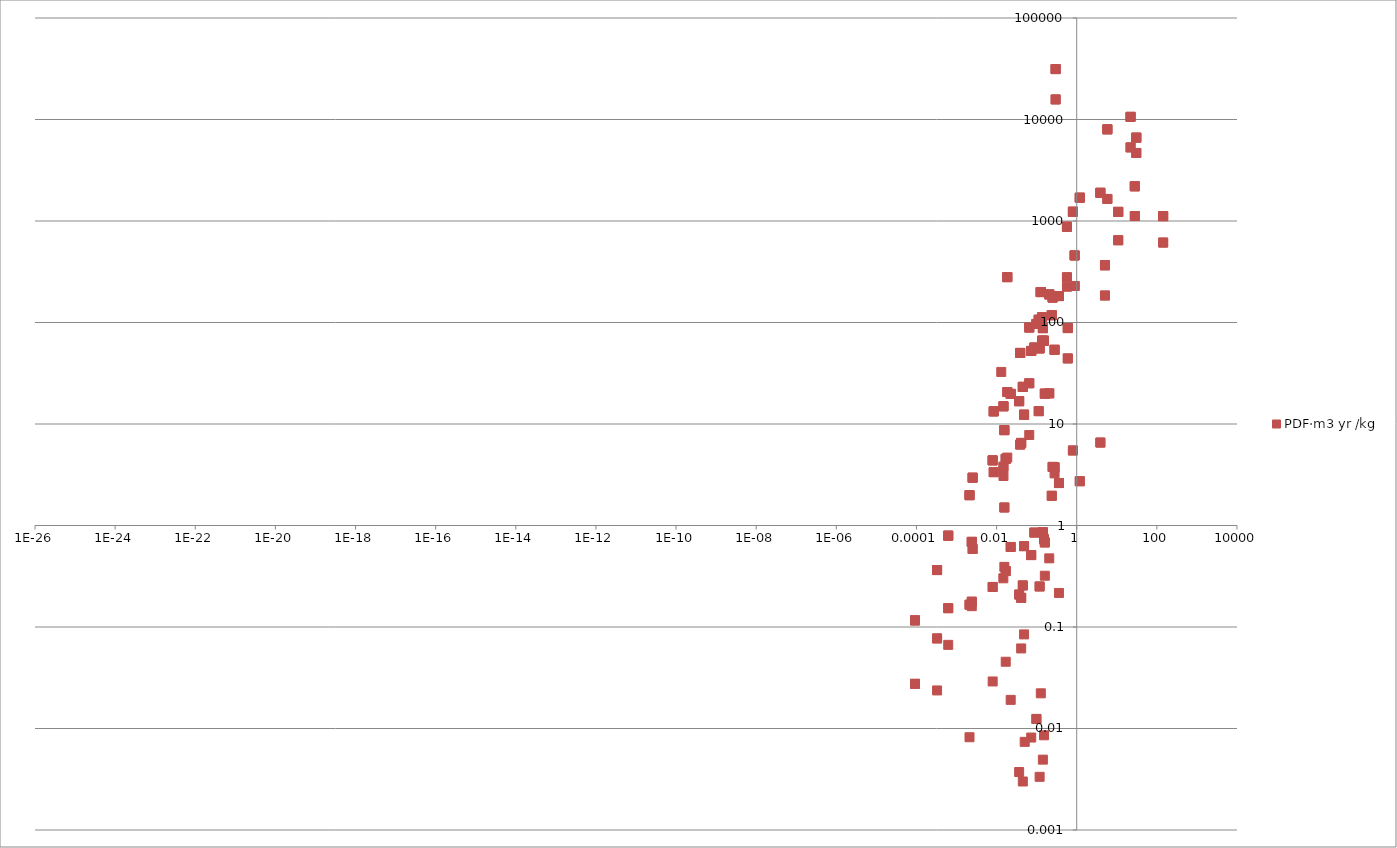
| Category | PDF·m3 yr /kg |
|---|---|
| 0.0 | 0 |
| 0.0 | 0 |
| 0.0 | 0 |
| 0.0 | 0 |
| 0.0 | 0 |
| 0.0 | 0 |
| 0.0 | 0 |
| 0.0 | 0 |
| 0.0 | 0 |
| 0.0 | 0 |
| 0.0 | 0 |
| 0.0 | 0 |
| 0.0 | 0 |
| 0.0 | 0 |
| 0.0 | 0 |
| 0.0 | 0 |
| 0.0 | 0 |
| 0.0 | 0.063 |
| 0.0 | 0.719 |
| 0.0 | 4.67 |
| 0.0 | 0 |
| 0.0 | 4.67 |
| 0.0 | 4.67 |
| 0.0 | 0 |
| 0.0 | 0 |
| 0.0 | 0 |
| 0.0 | 0 |
| 0.0 | 0 |
| 0.0 | 0 |
| 0.009692089763662115 | 0 |
| 0.0 | 0 |
| 0.0 | 0 |
| 0.0 | 0 |
| 0.0 | 0 |
| 0.0 | 0 |
| 0.0 | 0 |
| 0.0 | 0 |
| 0.0 | 0 |
| 0.0 | 0 |
| 0.0 | 0 |
| 0.0 | 0 |
| 0.0 | 0 |
| 0.0 | 0 |
| 0.0 | 0 |
| 0.0 | 0 |
| 0.0 | 0 |
| 0.0 | 0 |
| 0.0 | 0 |
| 0.0 | 0 |
| 0.0 | 0 |
| 0.0 | 0 |
| 0.0 | 0 |
| 0.0 | 0 |
| 0.0 | 0 |
| 0.0 | 0 |
| 0.0 | 0 |
| 0.0 | 0 |
| 0.0 | 0 |
| 0.0 | 0 |
| 0.0 | 0 |
| 0.0 | 0 |
| 0.0 | 0 |
| 0.0 | 0 |
| 0.0 | 0 |
| 0.0 | 0 |
| 0.0 | 0 |
| 0.0 | 0 |
| 0.0 | 0 |
| 0.0 | 0 |
| 0.0 | 0 |
| 0.0 | 0 |
| 0.0 | 0 |
| 0.0 | 0 |
| 0.0 | 0 |
| 0.0004613434727503168 | 0 |
| 0.0004613434727503168 | 0 |
| 0.0004613434727503168 | 0 |
| 0.0004613434727503168 | 0 |
| 0.0004613434727503168 | 0 |
| 6.313704188899892e-08 | 0 |
| 0.0004613434727503168 | 0 |
| 0.0004613434727503168 | 0 |
| 0.0 | 0 |
| 0.0 | 0 |
| 0.0 | 0 |
| 0.0 | 0 |
| 0.0 | 0 |
| 0.0 | 0 |
| 0.0 | 0 |
| 0.0 | 0 |
| 0.0 | 0 |
| 0.0 | 0 |
| 0.0 | 0 |
| 0.0 | 0 |
| 0.0 | 0 |
| 0.0 | 0 |
| 0.0 | 0 |
| 0.0 | 0 |
| 0.0 | 0 |
| 0.0 | 0 |
| 0.0 | 0 |
| 0.0 | 0 |
| 0.0 | 0 |
| 0.0 | 0 |
| 0.0 | 0 |
| 0.0 | 0 |
| 0.0 | 0 |
| 0.0 | 0 |
| 0.0 | 0 |
| 0.0 | 0 |
| 0.0 | 0 |
| 0.0 | 0 |
| 0.0 | 0 |
| 0.0 | 0 |
| 0.0 | 0 |
| 0.0 | 0 |
| 0.0 | 0 |
| 6.53523766921217 | 0 |
| 0.0 | 0 |
| 0.0 | 0 |
| 0.0 | 0 |
| 0.0 | 0 |
| 0.0 | 0 |
| 0.803058866132004 | 0 |
| 0.803058866132004 | 0 |
| 0.803058866132004 | 5.485 |
| 0.803058866132004 | 5.485 |
| 0.803058866132004 | 1234.74 |
| 9.249022803037563e-07 | 0 |
| 0.803058866132004 | 1234.74 |
| 0.803058866132004 | 1234.74 |
| 0.0 | 0 |
| 0.0 | 0 |
| 0.0 | 0 |
| 0.0 | 0 |
| 0.0 | 0 |
| 0.0 | 0 |
| 0.0 | 0 |
| 0.0 | 0 |
| 0.0 | 0 |
| 0.047020481196280786 | 0 |
| 0.00012461258267565576 | 0 |
| 0.00012461258267565576 | 0 |
| 0.00016282710802952355 | 0 |
| 0.00016282710802952355 | 0 |
| 0.00016282710802952355 | 0 |
| 0.0 | 0.089 |
| 0.0 | 0 |
| 0.0 | 0 |
| 0.0 | 0 |
| 0.0 | 0 |
| 0.0 | 0 |
| 0.0 | 0 |
| 0.0 | 0 |
| 0.0 | 0 |
| 0.0 | 0 |
| 0.0031180837353952983 | 0 |
| 0.0031180837353952983 | 0 |
| 0.0008584422362100732 | 0 |
| 0.0008584422362100732 | 0 |
| 0.0008584422362100732 | 0 |
| 0.014842743180922555 | 3.075 |
| 0.014842743180922555 | 0 |
| 0.014842743180922555 | 3.793 |
| 0.014842743180922555 | 3.793 |
| 0.014842743180922555 | 14.952 |
| 1.1187440755769987e-07 | 0 |
| 0.014842743180922555 | 14.952 |
| 0.014842743180922555 | 14.952 |
| 0.0 | 0 |
| 0.0 | 0 |
| 0.0 | 0 |
| 0.0 | 0 |
| 0.0 | 0 |
| 0.0 | 0 |
| 0.0 | 0 |
| 6.036787338509547e-06 | 0 |
| 6.036787338509547e-06 | 0 |
| 5.870637228275339e-06 | 0 |
| 5.870637228275339e-06 | 0 |
| 5.870637228275339e-06 | 0 |
| 0.0003267618834606085 | 0.024 |
| 0.0003267618834606085 | 0 |
| 0.0003267618834606085 | 0.077 |
| 0.0003267618834606085 | 0.077 |
| 0.0003267618834606085 | 0.364 |
| 1.9107262676933888e-07 | 0 |
| 0.0003267618834606085 | 0.364 |
| 0.0003267618834606085 | 0.364 |
| 5.593720377884994e-05 | 0 |
| 5.593720377884994e-05 | 0 |
| 5.4054169196195575e-05 | 0 |
| 5.4054169196195575e-05 | 0 |
| 5.4054169196195575e-05 | 0 |
| 0.00251994333855215 | 0 |
| 0.00251994333855215 | 0 |
| 0.00251994333855215 | 0.587 |
| 0.00251994333855215 | 0.587 |
| 0.00251994333855215 | 2.957 |
| 8.03058866132004e-06 | 0 |
| 0.00251994333855215 | 2.957 |
| 0.00251994333855215 | 2.957 |
| 0.0 | 7.959 |
| 0.0 | 7.959 |
| 0.0 | 40.059 |
| 0.0 | 0 |
| 0.0 | 40.059 |
| 0.0 | 40.059 |
| 0.0 | 0 |
| 0.0 | 0 |
| 0.0 | 0 |
| 0.0 | 0 |
| 0.0 | 0 |
| 0.0 | 0 |
| 0.0 | 0 |
| 0.0 | 0 |
| 0.0 | 0 |
| 0.23482548913101356 | 0 |
| 0.1606117732264008 | 0 |
| 0.1606117732264008 | 0 |
| 0.19273412787168093 | 0 |
| 0.19273412787168093 | 0 |
| 0.19273412787168093 | 0 |
| 0.01307047533842434 | 32.574 |
| 0.01307047533842434 | 0 |
| 0.01307047533842434 | 0 |
| 0.01307047533842434 | 0 |
| 0.01307047533842434 | 0 |
| 1.672577776357691e-11 | 0 |
| 0.01307047533842434 | 0 |
| 0.01307047533842434 | 0 |
| 0.0022984098582398737 | 0 |
| 0.0022984098582398737 | 0 |
| 0.0005649103747963063 | 0 |
| 0.0005649103747963063 | 0 |
| 0.0005649103747963063 | 0 |
| 0.11242824125848054 | 0 |
| 0.11242824125848054 | 0 |
| 0.11242824125848054 | 13.378 |
| 0.11242824125848054 | 13.378 |
| 0.11242824125848054 | 106.473 |
| 9.636706393584046e-05 | 0 |
| 0.11242824125848054 | 106.473 |
| 0.11242824125848054 | 106.473 |
| 0.0 | 0 |
| 0.0 | 0 |
| 0.0 | 0 |
| 0.0 | 0 |
| 0.0 | 0 |
| 0.0 | 0 |
| 0.0 | 0 |
| 0.0 | 0 |
| 0.0 | 0 |
| 0.0 | 0 |
| 0.0 | 0 |
| 0.0 | 0 |
| 0.0 | 0 |
| 0.0 | 0 |
| 0.0 | 0 |
| 0.0 | 0 |
| 0.0 | 0 |
| 0.0 | 0 |
| 0.0 | 0 |
| 0.0 | 0 |
| 0.0038269908723945847 | 0 |
| 0.0038269908723945847 | 0 |
| 0.0012793558488033993 | 0 |
| 0.0012793558488033993 | 0 |
| 0.0012793558488033993 | 0 |
| 0.0 | 0 |
| 12.350491527409439 | 0 |
| 0.0 | 0 |
| 0.0 | 0 |
| 0.0 | 0 |
| 0.0 | 0 |
| 0.0 | 0 |
| 0.0 | 0 |
| 0.0 | 0 |
| 0.0 | 0 |
| 0.0 | 0 |
| 0.0 | 0 |
| 0.0 | 0 |
| 0.0 | 0 |
| 0.0 | 0 |
| 0.0 | 0 |
| 0.0 | 0 |
| 0.0 | 0 |
| 0.0 | 0 |
| 0.0 | 0 |
| 0.0 | 0 |
| 0.0 | 0 |
| 0.0 | 0 |
| 0.0 | 0 |
| 0.0 | 0 |
| 0.0 | 0 |
| 0.0 | 0 |
| 0.0 | 0 |
| 0.0 | 0 |
| 0.0 | 0 |
| 0.0 | 0 |
| 0.0 | 0 |
| 0.0 | 0 |
| 0.0 | 0 |
| 0.0 | 0 |
| 0.0 | 0 |
| 3.118083735395298 | 0 |
| 0.0 | 0 |
| 0.0 | 0 |
| 0.0 | 0 |
| 0.0 | 0 |
| 0.0 | 0 |
| 0.0 | 0 |
| 0.0 | 0 |
| 0.10688990425067363 | 0 |
| 0.10688990425067363 | 0 |
| 0.03129160409410912 | 0 |
| 0.03129160409410912 | 0 |
| 0.03129160409410912 | 0 |
| 0.0 | 0 |
| 0.0 | 0 |
| 0.0 | 0 |
| 0.0 | 0 |
| 0.0 | 0 |
| 0.0 | 0 |
| 0.0 | 0 |
| 0.0 | 0 |
| 0.0 | 0 |
| 0.013181242078580478 | 0 |
| 0.013181242078580478 | 0 |
| 0.0025919417196536404 | 0 |
| 0.0025919417196536404 | 0 |
| 0.0025919417196536404 | 0 |
| 0.20602613669041756 | 0.475 |
| 0.20602613669041756 | 0 |
| 0.20602613669041756 | 20.031 |
| 0.20602613669041756 | 20.031 |
| 0.20602613669041756 | 189.195 |
| 6.5906210392902396e-09 | 0 |
| 0.20602613669041756 | 189.195 |
| 0.20602613669041756 | 189.195 |
| 0.0 | 0 |
| 0.0 | 0 |
| 0.0 | 0 |
| 0.0 | 0 |
| 0.0 | 0 |
| 0.0 | 0 |
| 0.509527004718237 | 0 |
| 0.509527004718237 | 0 |
| 0.2652863426739516 | 0 |
| 0.2652863426739516 | 0 |
| 0.2652863426739516 | 0 |
| 1.0578223684911223 | 0 |
| 0.5372186897572716 | 0 |
| 0.12904325228190133 | 0 |
| 1.0578223684911223 | 0 |
| 5.067578362143335 | 0 |
| 5.067578362143335 | 0 |
| 5.067578362143335 | 184.488 |
| 5.067578362143335 | 184.488 |
| 5.067578362143335 | 366.45 |
| 4.8017381857686026e-23 | 0 |
| 5.067578362143335 | 366.45 |
| 5.067578362143335 | 366.45 |
| 0.0 | 0 |
| 0.0 | 0 |
| 0.0 | 0 |
| 0.0 | 0 |
| 0.0 | 0 |
| 0.0 | 0 |
| 0.0 | 0 |
| 0.0 | 0 |
| 0.0 | 0 |
| 0.0 | 0 |
| 0.0 | 0 |
| 0.0 | 0 |
| 0.0 | 0 |
| 0.0 | 0 |
| 0.0 | 0 |
| 0.0 | 0 |
| 0.0 | 0 |
| 0.0 | 0 |
| 0.0 | 0 |
| 0.0 | 0 |
| 0.0 | 0 |
| 0.0 | 0 |
| 0.0 | 0 |
| 0.0 | 0 |
| 0.0 | 0 |
| 0.0 | 0 |
| 0.0 | 0 |
| 0.0 | 0 |
| 0.0 | 0 |
| 0.0 | 0 |
| 0.0 | 0 |
| 0.0 | 0 |
| 0.0 | 0 |
| 0.0 | 0 |
| 0.0 | 0 |
| 0.0 | 0 |
| 0.0 | 0 |
| 0.0 | 0 |
| 0.0 | 0 |
| 0.0 | 0 |
| 0.0 | 0 |
| 0.0 | 0 |
| 0.0 | 0 |
| 0.0 | 0 |
| 0.0 | 0 |
| 0.0 | 0 |
| 0.0 | 0 |
| 0.06646004409368308 | 0 |
| 0.06646004409368308 | 0 |
| 0.07642905070773555 | 0 |
| 0.07642905070773555 | 0 |
| 0.07642905070773555 | 0 |
| 0.04452822954276767 | 0 |
| 0.02824551873981531 | 0 |
| 0.017722678424982156 | 0 |
| 0.04452822954276767 | 0 |
| 5.161730091276053 | 0 |
| 5.161730091276053 | 0 |
| 5.161730091276053 | 0 |
| 5.161730091276053 | 0 |
| 5.161730091276053 | 0 |
| 1.6504244283264633e-23 | 0 |
| 5.161730091276053 | 0 |
| 5.161730091276053 | 0 |
| 0.0 | 0 |
| 0.0 | 0 |
| 0.0 | 0 |
| 0.0 | 0 |
| 0.0 | 0 |
| 0.0 | 0 |
| 0.00023648699023335565 | 0 |
| 0.0 | 0 |
| 9.082872692803356 | 0 |
| 0.0 | 0 |
| 2.603018393669254 | 0 |
| 0.0 | 0 |
| 0.0 | 0 |
| 0.0 | 0 |
| 0.0 | 0 |
| 0.0 | 0 |
| 0.0 | 0 |
| 0.0 | 0 |
| 0.0 | 0 |
| 0.0 | 0 |
| 0.0 | 0 |
| 0.0 | 0 |
| 0.11796657826628747 | 0 |
| 0.11796657826628747 | 0 |
| 0.05870637228275339 | 0 |
| 0.05870637228275339 | 0 |
| 0.05870637228275339 | 0 |
| 0.25144050015443437 | 0 |
| 0.12738175117955924 | 0 |
| 0.02985163647207932 | 0 |
| 0.25144050015443437 | 0 |
| 0.8861339212491078 | 0 |
| 0.8861339212491078 | 0 |
| 0.8861339212491078 | 228.93 |
| 0.8861339212491078 | 228.93 |
| 0.8861339212491078 | 457.83 |
| 1.0467456944755087e-23 | 0 |
| 0.8861339212491078 | 457.83 |
| 0.8861339212491078 | 457.83 |
| 0.0 | 0 |
| 0.0 | 0 |
| 0.0 | 0 |
| 0.0 | 0 |
| 0.0 | 0 |
| 0.0 | 0 |
| 0.0 | 0 |
| 0.0 | 0 |
| 0.0 | 0 |
| 0.0 | 0 |
| 0.0 | 0 |
| 0.0 | 0 |
| 0.0 | 0 |
| 0.0 | 0 |
| 0.0 | 0 |
| 0.0 | 0 |
| 0.0 | 0 |
| 0.019771863117870717 | 0 |
| 0.0 | 0 |
| 0.0 | 0 |
| 0.0 | 0 |
| 0.012959708598268203 | 0 |
| 0.0 | 0 |
| 0.0 | 0 |
| 0.0 | 0 |
| 0.0 | 0 |
| 0.0 | 0 |
| 0.0 | 0 |
| 0.0 | 0 |
| 0.0 | 0 |
| 0.0 | 0 |
| 0.0 | 0 |
| 0.0 | 0 |
| 0.0 | 0 |
| 0.0 | 0 |
| 0.0004923581599940355 | 0 |
| 0.0004923581599940355 | 0 |
| 0.0005649103747963063 | 0 |
| 0.0005649103747963063 | 0 |
| 0.0005649103747963063 | 0 |
| 1.0467456944755086e-05 | 0 |
| 1.0467456944755086e-05 | 0 |
| 1.0688990425067364e-05 | 0 |
| 1.0688990425067364e-05 | 0 |
| 1.0688990425067364e-05 | 0 |
| 0.02248564825169611 | 0.019 |
| 0.02248564825169611 | 0 |
| 0.02248564825169611 | 0.615 |
| 0.02248564825169611 | 0.615 |
| 0.02248564825169611 | 19.795 |
| 2.0602613669041757e-06 | 0 |
| 0.02248564825169611 | 19.795 |
| 0.02248564825169611 | 19.795 |
| 0.2381484913356977 | 0 |
| 0.2381484913356977 | 0 |
| 0.2381484913356977 | 1.963 |
| 0.2381484913356977 | 1.963 |
| 0.2381484913356977 | 117.978 |
| 8.08597203139811e-05 | 0 |
| 0.2381484913356977 | 117.978 |
| 0.2381484913356977 | 117.978 |
| 0.00036663790991681833 | 0 |
| 0.00036663790991681833 | 0 |
| 0.00036774557731837973 | 0 |
| 0.00036774557731837973 | 0 |
| 0.00036774557731837973 | 0 |
| 7.144454740070931e-06 | 0 |
| 7.144454740070931e-06 | 0 |
| 8.307505511710386e-06 | 0 |
| 8.307505511710386e-06 | 0 |
| 8.307505511710386e-06 | 0 |
| 0.0731060485030514 | 0.008 |
| 0.0731060485030514 | 0 |
| 0.0731060485030514 | 0.511 |
| 0.0731060485030514 | 0.511 |
| 0.0731060485030514 | 52.467 |
| 1.0024389984130532e-06 | 0 |
| 0.0731060485030514 | 52.467 |
| 0.0731060485030514 | 52.467 |
| 0.04419592932229926 | 0 |
| 0.04419592932229926 | 0 |
| 0.04402977921206504 | 0 |
| 0.04402977921206504 | 0 |
| 0.04402977921206504 | 0 |
| 0.021433364220212796 | 0 |
| 0.021433364220212796 | 0 |
| 0.021377980850134728 | 0 |
| 0.021377980850134728 | 0 |
| 0.021377980850134728 | 0 |
| 0.0007365988220383208 | 0 |
| 0.0007365988220383208 | 0 |
| 0.0012904325228190133 | 0 |
| 0.0012904325228190133 | 0 |
| 0.0012904325228190133 | 0 |
| 0.0 | 13.06 |
| 0.0 | 0 |
| 0.0 | 0 |
| 0.0 | 0 |
| 0.0 | 0 |
| 0.0 | 0 |
| 0.0 | 0 |
| 0.0 | 0 |
| 26.750167747707444 | 0 |
| 26.750167747707444 | 0 |
| 12.682791747877856 | 0 |
| 12.682791747877856 | 0 |
| 12.682791747877856 | 0 |
| 58.70637228275339 | 0 |
| 29.408569511454765 | 0 |
| 6.756771149524447 | 0 |
| 58.70637228275339 | 0 |
| 143.44292850219932 | 0 |
| 143.44292850219932 | 0 |
| 143.44292850219932 | 613.32 |
| 143.44292850219932 | 613.32 |
| 143.44292850219932 | 1115.82 |
| 5.6491037479630624e-21 | 0 |
| 143.44292850219932 | 1115.82 |
| 143.44292850219932 | 1115.82 |
| 0.0 | 0 |
| 0.04253442821995718 | 0 |
| 0.0 | 0 |
| 1.0412073574677017 | 0 |
| 0.0 | 0 |
| 0.03694070784207218 | 0 |
| 0.0 | 0 |
| 0.0 | 0 |
| 0.0 | 0 |
| 0.0 | 0 |
| 0.0 | 0 |
| 0.0 | 0 |
| 0.0 | 0 |
| 0.0 | 0 |
| 0.0 | 0 |
| 0.0 | 0 |
| 0.0 | 0 |
| 0.0 | 0 |
| 0.0 | 0 |
| 0.0 | 0 |
| 0.0 | 0 |
| 0.0 | 0 |
| 0.0 | 0 |
| 0.0 | 0 |
| 0.0 | 0 |
| 0.0 | 0 |
| 0.0 | 0 |
| 0.0 | 0 |
| 0.0 | 0 |
| 0.0 | 0 |
| 0.0 | 0 |
| 0.0 | 0 |
| 0.0 | 0 |
| 0.0 | 0 |
| 0.0 | 0 |
| 0.0 | 0 |
| 0.0 | 0 |
| 0.0 | 0 |
| 0.0 | 0 |
| 0.0 | 0 |
| 0.0 | 0 |
| 0.0 | 0 |
| 0.0 | 0 |
| 0.0 | 0 |
| 0.0 | 0 |
| 0.0 | 0 |
| 0.0 | 0 |
| 0.086398057321788 | 0 |
| 0.086398057321788 | 0 |
| 0.086398057321788 | 0 |
| 0.086398057321788 | 0 |
| 0.086398057321788 | 0 |
| 6.701387779446378e-13 | 0 |
| 0.086398057321788 | 0 |
| 0.086398057321788 | 0 |
| 0.0 | 0 |
| 0.0 | 0 |
| 0.0 | 0 |
| 0.0 | 0 |
| 0.0 | 0 |
| 0.0 | 0 |
| 0.0 | 0 |
| 0.0 | 0 |
| 0.034393072818481 | 0 |
| 0.034393072818481 | 0 |
| 0.03422692270824679 | 0 |
| 0.03422692270824679 | 0 |
| 0.03422692270824679 | 0 |
| 1.1962807936862956 | 0 |
| 0.23261015432789078 | 0 |
| 0.1545196025178132 | 0 |
| 1.1962807936862956 | 0 |
| 11.132057385691917 | 0 |
| 11.132057385691917 | 0 |
| 11.132057385691917 | 0 |
| 11.132057385691917 | 0 |
| 11.132057385691917 | 0 |
| 0.005394340245603944 | 0 |
| 11.132057385691917 | 0 |
| 11.132057385691917 | 0 |
| 0.0 | 0 |
| 0.0 | 0 |
| 1.7888828535216363 | 0 |
| 0.0 | 0 |
| 1.5895027212405872 | 0 |
| 0.0 | 0 |
| 0.0014787359810844484 | 0 |
| 0.0 | 0 |
| 0.0 | 0 |
| 0.0 | 0 |
| 0.0 | 0 |
| 0.0 | 0 |
| 0.0 | 0 |
| 0.0 | 0 |
| 0.0 | 0 |
| 0.0 | 0 |
| 0.0 | 0 |
| 0.0 | 0 |
| 0.0 | 0 |
| 0.0 | 0 |
| 0.0 | 0 |
| 0.0 | 0 |
| 0.0025864033826458336 | 0 |
| 0.0025864033826458336 | 0 |
| 0.0025864033826458336 | 0 |
| 0.0025864033826458336 | 0 |
| 0.0025864033826458336 | 0 |
| 2.2596414991852248e-07 | 0 |
| 0.0025864033826458336 | 0 |
| 0.0025864033826458336 | 0 |
| 0.0 | 0 |
| 0.0 | 0 |
| 0.0 | 0 |
| 0.0 | 0 |
| 0.0 | 0 |
| 0.0 | 0 |
| 0.0 | 0 |
| 0.0 | 0 |
| 0.0 | 0 |
| 0.0 | 0 |
| 0.0 | 0 |
| 0.0 | 0 |
| 0.0 | 0 |
| 0.0 | 0 |
| 0.0 | 0 |
| 0.0 | 0 |
| 0.0 | 0 |
| 0.0 | 0 |
| 0.0 | 0 |
| 0.0 | 0 |
| 0.0 | 0 |
| 0.0 | 0 |
| 0.0 | 0 |
| 0.0 | 0 |
| 0.0 | 0 |
| 0.0 | 0 |
| 0.0 | 0 |
| 0.0 | 0 |
| 0.0 | 0 |
| 0.0 | 0 |
| 0.0 | 0 |
| 0.0 | 0 |
| 0.0 | 0 |
| 0.0 | 0 |
| 0.15562726991937456 | 0 |
| 0.15562726991937456 | 0 |
| 0.06646004409368308 | 0 |
| 0.06646004409368308 | 0 |
| 0.06646004409368308 | 0 |
| 0.25587116976067986 | 0 |
| 0.04918043262932549 | 0 |
| 0.035279206739730104 | 0 |
| 0.25587116976067986 | 0 |
| 0.0 | 0 |
| 2.985163647207932 | 0 |
| 2.985163647207932 | 0 |
| 2.985163647207932 | 0 |
| 2.985163647207932 | 0 |
| 2.985163647207932 | 0 |
| 5.8706372282753395e-24 | 0 |
| 2.985163647207932 | 0 |
| 2.985163647207932 | 0 |
| 0.0 | 0 |
| 0.0 | 0 |
| 0.0 | 0 |
| 0.0 | 0 |
| 0.0 | 0 |
| 0.0 | 0 |
| 0.0 | 0 |
| 0.0 | 0 |
| 0.0 | 0 |
| 0.0 | 0 |
| 0.0 | 0 |
| 0.0 | 0 |
| 0.0 | 0 |
| 0.0 | 0 |
| 0.0 | 0 |
| 0.0 | 0 |
| 0.0 | 0 |
| 0.0 | 0 |
| 0.0 | 0 |
| 0.0 | 0 |
| 0.0 | 0 |
| 0.0 | 0 |
| 0.0 | 0 |
| 0.0 | 0 |
| 0.0 | 0 |
| 0.0 | 0 |
| 0.0 | 0 |
| 0.006812154519602517 | 0 |
| 0.0 | 0 |
| 0.14731976440766417 | 0 |
| 0.0 | 0 |
| 1.9328796157246164 | 0 |
| 0.0 | 0 |
| 0.019107262676933887 | 0 |
| 0.0 | 0 |
| 4.945734947971583 | 0 |
| 0.0 | 0 |
| 0.0 | 0 |
| 0.0 | 0 |
| 0.0 | 0 |
| 0.0 | 0 |
| 0.0 | 0 |
| 0.0 | 0 |
| 0.0 | 0 |
| 0.0 | 0 |
| 0.0 | 0 |
| 0.0 | 0 |
| 0.0 | 0 |
| 0.0 | 0 |
| 0.0 | 0 |
| 0.0 | 0 |
| 0.0 | 0 |
| 0.0 | 0 |
| 0.0 | 0 |
| 0.0 | 0 |
| 0.0 | 0 |
| 1.517504340139097e-05 | 0 |
| 1.517504340139097e-05 | 0 |
| 1.5673493732093594e-05 | 0 |
| 1.5673493732093594e-05 | 0 |
| 1.5673493732093594e-05 | 0 |
| 0.0 | 0.692 |
| 0.0 | 1.447 |
| 0.0 | 46.026 |
| 0.0 | 0 |
| 0.0 | 46.026 |
| 0.0 | 46.026 |
| 0.0 | 0 |
| 0.0 | 0 |
| 0.0 | 0 |
| 0.0 | 0 |
| 0.0 | 0 |
| 0.0 | 0 |
| 0.0 | 0 |
| 0.0 | 0 |
| 0.0 | 0 |
| 0.0 | 0 |
| 0.0 | 0 |
| 0.0 | 0 |
| 0.0 | 0 |
| 0.0 | 0 |
| 0.0 | 0 |
| 0.0 | 0 |
| 0.0 | 0 |
| 0.0 | 0 |
| 0.0 | 0 |
| 0.0 | 0 |
| 0.0 | 0 |
| 0.0 | 0 |
| 0.0 | 0 |
| 0.0 | 0 |
| 0.0 | 0 |
| 0.0 | 0 |
| 0.0 | 0 |
| 0.0 | 0 |
| 0.0 | 0 |
| 0.0 | 0 |
| 0.0 | 0 |
| 0.0 | 0 |
| 0.0 | 0 |
| 0.11021290645535778 | 0 |
| 0.011132057385691917 | 0 |
| 0.011132057385691917 | 0 |
| 0.011132057385691917 | 0 |
| 0.011132057385691917 | 0 |
| 0.011132057385691917 | 0 |
| 1.2239724787253301e-11 | 0 |
| 0.011132057385691917 | 0 |
| 0.011132057385691917 | 0 |
| 0.0 | 0 |
| 0.0 | 0 |
| 0.0 | 0 |
| 0.0 | 0 |
| 0.0 | 0 |
| 0.0 | 0 |
| 0.0 | 0 |
| 0.0 | 0 |
| 0.0 | 0 |
| 0.0 | 0 |
| 0.0 | 0 |
| 0.0 | 0 |
| 0.0 | 0 |
| 0.0 | 0 |
| 0.0 | 0 |
| 0.0 | 0 |
| 0.0 | 0 |
| 0.0 | 0 |
| 0.0 | 0 |
| 0.0 | 0 |
| 0.0 | 0 |
| 0.0 | 0 |
| 0.0 | 0 |
| 0.0 | 0 |
| 0.0 | 0 |
| 0.0 | 0 |
| 0.0 | 0 |
| 0.0 | 0 |
| 0.0 | 0 |
| 0.0 | 0 |
| 0.0 | 0 |
| 0.0 | 0 |
| 0.0 | 0 |
| 0.0 | 0 |
| 0.0 | 0 |
| 0.0 | 0 |
| 0.0 | 0 |
| 0.0 | 0 |
| 0.0 | 0 |
| 0.0 | 0 |
| 0.0 | 0 |
| 0.0 | 0 |
| 0.0 | 0 |
| 0.0 | 0 |
| 0.0 | 0 |
| 0.0 | 0 |
| 0.0 | 0 |
| 0.0 | 0 |
| 0.0 | 0 |
| 0.0 | 0 |
| 0.0 | 0 |
| 0.0 | 0 |
| 0.0 | 0 |
| 0.0 | 0 |
| 0.0 | 0 |
| 0.0 | 0 |
| 0.0 | 0 |
| 0.0 | 0 |
| 0.0 | 0 |
| 0.0 | 0 |
| 0.0 | 0 |
| 0.0 | 0 |
| 0.0 | 0 |
| 0.0 | 0 |
| 0.0 | 0 |
| 0.0 | 0 |
| 0.0 | 0 |
| 0.0 | 0 |
| 0.0 | 0 |
| 0.0 | 0 |
| 0.0 | 0 |
| 0.0 | 0 |
| 0.0 | 0 |
| 0.0 | 0 |
| 0.0 | 0 |
| 0.0 | 4263.6 |
| 0.0 | 4673.1 |
| 0.0 | 21585.9 |
| 0.0 | 0 |
| 0.0 | 21585.9 |
| 0.0 | 21585.9 |
| 0.0 | 0 |
| 0.0 | 0 |
| 0.0 | 0 |
| 0.0 | 0 |
| 0.0 | 0 |
| 0.0 | 0 |
| 0.0 | 0 |
| 0.0 | 0 |
| 0.0 | 0 |
| 0.008030588661320039 | 0 |
| 0.0 | 0 |
| 0.0 | 0 |
| 0.0 | 0 |
| 0.0 | 0 |
| 0.0 | 0 |
| 0.0 | 0 |
| 0.0 | 0 |
| 0.0 | 0 |
| 0.0 | 0 |
| 0.0 | 0 |
| 0.0 | 0 |
| 0.0 | 0 |
| 0.0 | 0 |
| 0.122397247872533 | 0 |
| 0.0 | 0 |
| 0.0 | 0 |
| 0.0 | 0 |
| 0.0 | 0 |
| 0.0 | 0 |
| 0.0 | 0 |
| 0.0 | 0 |
| 0.0 | 0 |
| 0.003998679319636599 | 0 |
| 0.003998679319636599 | 0 |
| 0.003998679319636599 | 0 |
| 0.003998679319636599 | 0 |
| 0.003998679319636599 | 0 |
| 6.258320818821823 | 0 |
| 6.258320818821823 | 0 |
| 6.258320818821823 | 0 |
| 6.258320818821823 | 0 |
| 6.258320818821823 | 0 |
| 0.0007753671810929693 | 0 |
| 6.258320818821823 | 0 |
| 6.258320818821823 | 0 |
| 0.0 | 0 |
| 0.0 | 0 |
| 0.0 | 0 |
| 0.007809055181007763 | 0 |
| 0.0 | 0 |
| 0.13458158928970826 | 0 |
| 0.13458158928970826 | 0 |
| 0.035113056629495897 | 0 |
| 0.035113056629495897 | 0 |
| 0.035113056629495897 | 0 |
| 0.5704487118041132 | 224.844 |
| 0.5704487118041132 | 0 |
| 0.5704487118041132 | 278.781 |
| 0.5704487118041132 | 278.781 |
| 0.5704487118041132 | 878.43 |
| 4.120522733808351e-13 | 0 |
| 0.5704487118041132 | 878.43 |
| 0.5704487118041132 | 878.43 |
| 5.759870488119201e-05 | 0 |
| 5.759870488119201e-05 | 0 |
| 5.759870488119201e-05 | 0 |
| 5.759870488119201e-05 | 0 |
| 5.759870488119201e-05 | 0 |
| 0.04846044881831058 | 0.085 |
| 0.04846044881831058 | 0 |
| 0.04846044881831058 | 0.626 |
| 0.04846044881831058 | 0.626 |
| 0.04846044881831058 | 12.354 |
| 3.334078878699768e-05 | 0 |
| 0.04846044881831058 | 12.354 |
| 0.04846044881831058 | 12.354 |
| 0.0 | 0 |
| 0.0 | 0 |
| 0.0 | 0 |
| 0.0 | 0 |
| 0.0 | 0 |
| 0.0 | 0 |
| 0.0 | 0 |
| 0.0 | 0 |
| 0.0 | 0 |
| 0.0 | 0 |
| 0.0 | 0 |
| 0.0 | 0 |
| 0.0 | 0 |
| 0.0 | 0 |
| 0.0 | 0 |
| 0.0 | 0 |
| 0.0 | 0 |
| 0.0 | 25.316 |
| 0.0 | 45.39 |
| 0.0 | 166.14 |
| 0.0 | 0 |
| 0.0 | 166.14 |
| 0.0 | 166.14 |
| 0.0 | 0 |
| 0.07365988220383209 | 0 |
| 0.0 | 0 |
| 0.3771607502316515 | 0 |
| 0.0 | 0 |
| 3.2233121385436294 | 0 |
| 0.0 | 0 |
| 0.5073116699151142 | 0 |
| 0.0 | 0 |
| 0.0 | 0 |
| 0.00336730890074661 | 0 |
| 0.00336730890074661 | 0 |
| 0.004203597788925455 | 0 |
| 0.004203597788925455 | 0 |
| 0.004203597788925455 | 0 |
| 0.0014842743180922557 | 0 |
| 0.0010744373795145432 | 0 |
| 0.0008861339212491077 | 0 |
| 0.0014842743180922557 | 0 |
| 0.00336730890074661 | 0 |
| 0.00336730890074661 | 0 |
| 0.004203597788925455 | 0 |
| 0.004203597788925455 | 0 |
| 0.004203597788925455 | 0 |
| 0.0014842743180922557 | 0 |
| 0.0010744373795145432 | 0 |
| 0.0008861339212491077 | 0 |
| 0.0014842743180922557 | 0 |
| 0.2974086973192318 | 0 |
| 0.2974086973192318 | 0 |
| 0.2974086973192318 | 15766.5 |
| 0.2974086973192318 | 15766.5 |
| 0.2974086973192318 | 31392 |
| 3.1623904314577535e-25 | 0 |
| 0.2974086973192318 | 31392 |
| 0.2974086973192318 | 31392 |
| 0.0 | 0 |
| 0.2974086973192318 | 0 |
| 0.2974086973192318 | 0 |
| 0.2974086973192318 | 0 |
| 0.2974086973192318 | 0 |
| 0.2974086973192318 | 0 |
| 3.1623904314577535e-25 | 0 |
| 0.2974086973192318 | 0 |
| 0.2974086973192318 | 0 |
| 0.0 | 0 |
| 0.0 | 0 |
| 0.0 | 0 |
| 0.0 | 0 |
| 0.0 | 0 |
| 0.0 | 0 |
| 0.0 | 0 |
| 0.0 | 0 |
| 0.0 | 0 |
| 0.0 | 0 |
| 0.0 | 0 |
| 0.0 | 0 |
| 0.0 | 0 |
| 0.0 | 0 |
| 0.0 | 0 |
| 0.0 | 0 |
| 0.0 | 0 |
| 0.0 | 0 |
| 0.0 | 0 |
| 0.0 | 0 |
| 0.0 | 0 |
| 0.0 | 0 |
| 0.0 | 0 |
| 0.0 | 0 |
| 0.0 | 0 |
| 0.0 | 0 |
| 0.04646664749550009 | 0 |
| 0.0 | 0 |
| 0.0010412073574677016 | 0 |
| 0.0 | 0 |
| 0.0 | 0 |
| 0.0 | 0 |
| 0.0 | 0 |
| 1.9328796157246164 | 0 |
| 1.9328796157246164 | 0 |
| 0.9249022803037563 | 0 |
| 0.9249022803037563 | 0 |
| 0.9249022803037563 | 0 |
| 4.192521114909841 | 0 |
| 2.1156447369822446 | 0 |
| 0.4868198229862286 | 0 |
| 4.192521114909841 | 0 |
| 10.85514053530157 | 0 |
| 10.85514053530157 | 0 |
| 10.85514053530157 | 646.14 |
| 10.85514053530157 | 646.14 |
| 10.85514053530157 | 1229.82 |
| 2.1322597480056656e-22 | 0 |
| 10.85514053530157 | 1229.82 |
| 10.85514053530157 | 1229.82 |
| 0.0 | 0 |
| 0.0 | 0 |
| 0.0 | 0 |
| 0.0 | 0 |
| 0.0 | 0 |
| 0.0 | 0 |
| 0.0 | 0 |
| 0.0 | 0 |
| 0.0 | 0 |
| 0.0 | 0 |
| 0.0 | 0 |
| 0.0 | 0 |
| 0.0 | 0 |
| 0.0 | 0 |
| 0.0 | 0 |
| 0.0 | 0 |
| 0.0 | 0 |
| 0.0 | 0 |
| 0.0 | 0 |
| 0.0 | 0 |
| 0.0 | 0 |
| 0.0 | 0 |
| 0.0 | 0 |
| 0.0 | 0 |
| 0.0 | 0 |
| 0.0 | 0 |
| 0.0 | 0 |
| 0.0 | 0 |
| 0.0 | 0 |
| 0.0 | 0 |
| 0.0 | 0 |
| 0.0 | 0 |
| 0.0 | 0 |
| 0.0 | 0 |
| 0.0 | 0 |
| 0.0 | 0 |
| 0.0 | 0 |
| 0.0 | 0 |
| 0.0 | 0 |
| 0.0 | 0 |
| 0.0 | 0 |
| 0.0 | 0 |
| 0.0 | 0 |
| 0.0 | 0 |
| 0.0 | 0 |
| 0.0 | 0 |
| 0.0 | 0 |
| 0.0 | 0 |
| 0.0 | 0 |
| 1.4344292850219933 | 0 |
| 1.4344292850219933 | 0 |
| 0.5981403968431478 | 0 |
| 0.5981403968431478 | 0 |
| 0.5981403968431478 | 0 |
| 0.6756771149524446 | 0 |
| 0.20934913889510173 | 0 |
| 0.16891927873811116 | 0 |
| 0.6756771149524446 | 0 |
| 0.0 | 0 |
| 0.0 | 0 |
| 0.0 | 0 |
| 0.0 | 0 |
| 0.0 | 0 |
| 0.0 | 0 |
| 0.0 | 0 |
| 0.0 | 0 |
| 0.0 | 0 |
| 0.0 | 0 |
| 0.0 | 0 |
| 0.0 | 0 |
| 0.0 | 0 |
| 0.0 | 0 |
| 0.0 | 0 |
| 0.0 | 0 |
| 0.0 | 0 |
| 0.0 | 0 |
| 0.0 | 0 |
| 9.525939653427909e-06 | 0 |
| 9.525939653427909e-06 | 0 |
| 1.085514053530157e-05 | 0 |
| 1.085514053530157e-05 | 0 |
| 1.085514053530157e-05 | 0 |
| 0.12682791747877856 | 0.022 |
| 0.12682791747877856 | 199.521 |
| 0.12682791747877856 | 199.521 |
| 0.12682791747877856 | 199.521 |
| 0.12682791747877856 | 199.521 |
| 9.747473133740186e-07 | 0 |
| 0.12682791747877856 | 199.521 |
| 0.12682791747877856 | 199.521 |
| 0.0 | 0 |
| 0.0 | 0 |
| 0.0 | 0 |
| 0.0 | 0 |
| 0.0 | 0 |
| 0.0 | 0 |
| 0.0 | 0 |
| 0.0 | 0 |
| 0.0 | 0 |
| 0.0 | 0 |
| 0.0 | 0 |
| 0.0 | 0 |
| 0.0 | 0 |
| 0.0 | 0 |
| 0.0 | 0 |
| 0.0 | 0 |
| 0.0 | 0 |
| 0.0 | 0 |
| 0.0 | 0 |
| 0.0 | 0 |
| 0.0 | 0 |
| 0.0 | 0 |
| 0.0 | 0 |
| 0.0 | 0 |
| 0.20879530519432105 | 0 |
| 0.03057162028309422 | 0 |
| 0.03057162028309422 | 0 |
| 0.030294703432703875 | 0 |
| 0.030294703432703875 | 0 |
| 0.030294703432703875 | 0 |
| 2.01595467084172 | 0 |
| 2.01595467084172 | 0 |
| 2.01595467084172 | 0 |
| 2.01595467084172 | 0 |
| 2.01595467084172 | 0 |
| 0.0017501144944669879 | 0 |
| 2.01595467084172 | 0 |
| 2.01595467084172 | 0 |
| 0.0 | 0 |
| 0.0 | 0 |
| 0.0 | 0 |
| 0.0 | 0 |
| 0.0 | 0 |
| 0.0 | 0 |
| 0.0 | 0 |
| 0.0 | 0 |
| 0.0 | 0 |
| 0.0 | 0 |
| 0.0 | 0 |
| 0.017722678424982156 | 0 |
| 0.017722678424982156 | 0 |
| 0.017722678424982156 | 0 |
| 0.017722678424982156 | 0 |
| 0.017722678424982156 | 0 |
| 4.868198229862286e-06 | 0 |
| 0.017722678424982156 | 0 |
| 0.017722678424982156 | 0 |
| 0.0 | 0 |
| 0.0012793558488033993 | 0 |
| 0.0 | 0 |
| 1.6338094173030424 | 0 |
| 0.0 | 0 |
| 0.00237594657634917 | 0 |
| 0.0 | 0 |
| 575.9870488119201 | 0 |
| 0.0 | 0 |
| 0.0 | 0 |
| 0.0 | 0 |
| 0.0 | 0 |
| 0.0 | 0 |
| 0.17611911684826015 | 0 |
| 0.0 | 0 |
| 0.0033783855747622237 | 0 |
| 0.0 | 0 |
| 0.0 | 0 |
| 4.020832667667826 | 0 |
| 0.0 | 0 |
| 0.0 | 0 |
| 0.0 | 0 |
| 0.0 | 0 |
| 0.0 | 0 |
| 0.0 | 0 |
| 0.06313704188899893 | 0 |
| 0.0 | 0 |
| 0.07476754960539347 | 0 |
| 0.0 | 0 |
| 0.0 | 0 |
| 0.0 | 0 |
| 0.0 | 0 |
| 0.0 | 0 |
| 0.0 | 0 |
| 0.0 | 0 |
| 0.0 | 0 |
| 0.0 | 0 |
| 0.0 | 0 |
| 0.0 | 0 |
| 0.0 | 0 |
| 0.0 | 0 |
| 0.0 | 0 |
| 0.0 | 0 |
| 0.017944211905294435 | 0 |
| 0.0 | 0 |
| 0.0 | 0 |
| 0.0 | 0 |
| 0.0 | 0 |
| 0.0 | 0 |
| 0.0 | 0 |
| 0.0 | 0 |
| 0.0 | 0 |
| 0.0 | 0 |
| 0.0 | 0 |
| 0.0 | 0 |
| 0.0 | 0.035 |
| 0.0 | 2.14 |
| 0.0 | 19.64 |
| 0.0 | 0 |
| 0.0 | 19.64 |
| 0.0 | 19.64 |
| 0.0 | 0 |
| 0.0 | 0 |
| 0.0 | 0 |
| 0.0 | 0 |
| 0.0 | 0 |
| 0.0 | 0 |
| 0.0 | 0 |
| 0.0 | 0 |
| 0.0 | 0 |
| 0.0 | 0 |
| 0.0 | 0 |
| 0.0 | 0 |
| 0.0 | 0 |
| 0.0 | 0 |
| 0.21931814550915418 | 0 |
| 0.0 | 0 |
| 3.838067546410198 | 0 |
| 0.0 | 0 |
| 0.0004613434727503168 | 0 |
| 0.0 | 0 |
| 0.0 | 0 |
| 0.0 | 0 |
| 0.0 | 0 |
| 0.0 | 0 |
| 0.0 | 0 |
| 0.0 | 0 |
| 0.0 | 0 |
| 0.0 | 0 |
| 0.0 | 0 |
| 0.0 | 0 |
| 0.0 | 0 |
| 0.0 | 0 |
| 0.0 | 0 |
| 0.0 | 0 |
| 0.0 | 0 |
| 0.0 | 0 |
| 0.0869518910225687 | 0 |
| 0.0 | 0 |
| 1.4344292850219933 | 0 |
| 0.0 | 0 |
| 0.06147554078665685 | 0 |
| 0.0 | 0 |
| 0.0 | 0 |
| 0.0 | 0 |
| 0.0 | 0 |
| 0.0 | 0 |
| 0.0 | 0 |
| 0.0 | 0 |
| 0.0 | 0 |
| 0.0 | 0 |
| 0.0 | 0 |
| 0.0 | 0 |
| 0.0 | 0 |
| 1.7833445165138293e-05 | 0 |
| 1.7833445165138293e-05 | 0 |
| 2.7248618078410065e-05 | 0 |
| 2.7248618078410065e-05 | 0 |
| 2.7248618078410065e-05 | 0 |
| 0.01163050771639454 | 0 |
| 0.01163050771639454 | 0 |
| 0.01163050771639454 | 0 |
| 0.01163050771639454 | 0 |
| 0.01163050771639454 | 0 |
| 1.168589108647261e-07 | 0 |
| 0.01163050771639454 | 0 |
| 0.01163050771639454 | 0 |
| 0.0 | 0 |
| 0.0 | 0 |
| 0.0 | 0 |
| 0.0 | 0 |
| 0.0 | 0 |
| 0.0 | 0 |
| 9.249022803037562 | 0 |
| 43.586712251440495 | 0 |
| 43.586712251440495 | 0 |
| 47.07586456635886 | 0 |
| 47.07586456635886 | 0 |
| 47.07586456635886 | 0 |
| 0.0 | 0 |
| 0.0 | 0 |
| 0.0 | 0 |
| 0.0 | 0 |
| 0.0 | 0.124 |
| 0.0 | 5.759 |
| 0.0 | 112.545 |
| 0.0 | 0 |
| 0.0 | 112.545 |
| 0.0 | 112.545 |
| 0.0 | 0 |
| 0.0 | 0 |
| 0.0 | 0 |
| 0.0 | 0 |
| 0.0 | 0 |
| 0.0 | 0 |
| 0.0 | 0 |
| 0.0 | 0 |
| 0.0 | 0 |
| 0.0 | 0 |
| 0.0 | 0 |
| 0.0 | 0 |
| 0.0 | 0 |
| 0.0 | 0 |
| 0.0 | 0 |
| 0.0 | 0 |
| 0.0 | 0 |
| 0.0 | 0 |
| 0.0 | 0 |
| 0.0 | 0 |
| 0.0 | 0 |
| 1.8774962456465472 | 0 |
| 0.0 | 0 |
| 3.815914198378971 | 0 |
| 0.0 | 0 |
| 0.35279206739730107 | 0 |
| 0.0 | 0 |
| 0.0 | 0 |
| 0.0 | 0 |
| 0.0 | 0 |
| 0.0 | 0 |
| 0.0 | 0 |
| 0.0 | 0 |
| 0.0 | 0 |
| 0.0 | 0 |
| 0.0 | 0 |
| 0.011575124346316471 | 0 |
| 0.0 | 0 |
| 0.2464559968474081 | 0 |
| 0.0 | 0 |
| 0.01024592346444281 | 0 |
| 0.0 | 0 |
| 0.0 | 0 |
| 0.0 | 0 |
| 0.0 | 0 |
| 0.0 | 0 |
| 0.0 | 0 |
| 0.002652863426739516 | 0 |
| 0.002652863426739516 | 0 |
| 0.0025642500346146056 | 0 |
| 0.0025642500346146056 | 0 |
| 0.0025642500346146056 | 0 |
| 0.0 | 0 |
| 0.6202937448743754 | 0 |
| 0.0 | 0 |
| 0.003921142601527302 | 0 |
| 0.0 | 0 |
| 0.0 | 0 |
| 0.0 | 0 |
| 0.0 | 0 |
| 0.0 | 0 |
| 0.0 | 0 |
| 0.0 | 0 |
| 0.0 | 0 |
| 0.0 | 0 |
| 0.00020270313448573344 | 0 |
| 0.00020270313448573344 | 0 |
| 0.0004042986015699054 | 0 |
| 0.0004042986015699054 | 0 |
| 0.0004042986015699054 | 0 |
| 0.0 | 0 |
| 0.0 | 0 |
| 0.0 | 0 |
| 0.0 | 0 |
| 0.0 | 0 |
| 2.5697883716224128e-05 | 0 |
| 2.5697883716224128e-05 | 0 |
| 2.5697883716224128e-05 | 0 |
| 2.5697883716224128e-05 | 0 |
| 2.5697883716224128e-05 | 0 |
| 0.0410390772278493 | 0.061 |
| 0.0410390772278493 | 0 |
| 0.0410390772278493 | 0.194 |
| 0.0410390772278493 | 0.194 |
| 0.0410390772278493 | 6.508 |
| 1.091052390537964e-05 | 0 |
| 0.0410390772278493 | 6.508 |
| 0.0410390772278493 | 6.508 |
| 0.0 | 0 |
| 0.0 | 0 |
| 0.0 | 0 |
| 0.0 | 0 |
| 0.0 | 0 |
| 0.00013458158928970825 | 0 |
| 0.00013458158928970825 | 0 |
| 0.00013458158928970825 | 0 |
| 0.00013458158928970825 | 0 |
| 0.00013458158928970825 | 0 |
| 0.0 | 0 |
| 0.0 | 0 |
| 0.0 | 0 |
| 0.0 | 0 |
| 0.0 | 0 |
| 0.0 | 0 |
| 0.0 | 0 |
| 0.0 | 0 |
| 0.0 | 0 |
| 0.0 | 0 |
| 0.0 | 0 |
| 0.0 | 0 |
| 0.0 | 0 |
| 0.0 | 0 |
| 0.0 | 0 |
| 5.759870488119201e-05 | 0 |
| 5.759870488119201e-05 | 0 |
| 5.759870488119201e-05 | 0 |
| 5.759870488119201e-05 | 0 |
| 5.759870488119201e-05 | 0 |
| 0.016891927873811118 | 0.045 |
| 0.016891927873811118 | 0 |
| 0.016891927873811118 | 0.356 |
| 0.016891927873811118 | 0.356 |
| 0.016891927873811118 | 4.535 |
| 4.4417462802611526e-05 | 0 |
| 0.016891927873811118 | 4.535 |
| 0.016891927873811118 | 4.535 |
| 0.0 | 0 |
| 0.0 | 0 |
| 0.0 | 0 |
| 0.0 | 0 |
| 0.0 | 0 |
| 0.0 | 0 |
| 0.0 | 0 |
| 0.0 | 0 |
| 0.0 | 0 |
| 0.0 | 0 |
| 0.0 | 0 |
| 0.0 | 0 |
| 0.0 | 0 |
| 0.0 | 0 |
| 0.0 | 0 |
| 0.0 | 0 |
| 0.0 | 0 |
| 0.0 | 0 |
| 0.0 | 0 |
| 0.0 | 0 |
| 0.0 | 0 |
| 0.0 | 0 |
| 0.0 | 0 |
| 0.0 | 0 |
| 0.0 | 0 |
| 1.00797733542086 | 0 |
| 1.00797733542086 | 0 |
| 1.00797733542086 | 0 |
| 1.00797733542086 | 0 |
| 1.00797733542086 | 0 |
| 0.0006701387779446378 | 0 |
| 1.00797733542086 | 0 |
| 1.00797733542086 | 0 |
| 0.0 | 0 |
| 0.0 | 0 |
| 0.0 | 0 |
| 0.0 | 0 |
| 0.0 | 0 |
| 0.0 | 0 |
| 0.0 | 0 |
| 0.0 | 0 |
| 0.0 | 0 |
| 0.0 | 0 |
| 3.4669989668871347e-06 | 0 |
| 3.4669989668871347e-06 | 0 |
| 3.0017786582313527e-06 | 0 |
| 3.0017786582313527e-06 | 0 |
| 3.0017786582313527e-06 | 0 |
| 0.0 | 0.045 |
| 0.0 | 0 |
| 0.0 | 0.181 |
| 0.0 | 0.181 |
| 0.0 | 0.934 |
| 0.0 | 0 |
| 0.0 | 0.934 |
| 0.0 | 0.934 |
| 0.0 | 0 |
| 0.0 | 0 |
| 0.0 | 0 |
| 0.0 | 0 |
| 0.0 | 0 |
| 0.0 | 0 |
| 0.0 | 0 |
| 0.0 | 0 |
| 0.0 | 0 |
| 0.0 | 0 |
| 0.0 | 0 |
| 0.0 | 0 |
| 0.0 | 0 |
| 0.0 | 0 |
| 0.0 | 0 |
| 0.0 | 0 |
| 0.0 | 0 |
| 0.0 | 0 |
| 0.0 | 0 |
| 0.0 | 0 |
| 0.0 | 0 |
| 0.0 | 0 |
| 0.0 | 0 |
| 0.0 | 0 |
| 0.0 | 0 |
| 0.0 | 0 |
| 9.138256062881426e-05 | 0 |
| 9.138256062881426e-05 | 0 |
| 9.138256062881426e-05 | 0 |
| 9.138256062881426e-05 | 0 |
| 9.138256062881426e-05 | 0 |
| 0.36054573920823074 | 0.216 |
| 0.36054573920823074 | 0 |
| 0.36054573920823074 | 2.62 |
| 0.36054573920823074 | 2.62 |
| 0.36054573920823074 | 182.115 |
| 5.0841933731667563e-05 | 0 |
| 0.36054573920823074 | 182.115 |
| 0.36054573920823074 | 182.115 |
| 8.695189102256871e-06 | 0 |
| 8.695189102256871e-06 | 0 |
| 9.082872692803356e-06 | 0 |
| 9.082872692803356e-06 | 0 |
| 9.082872692803356e-06 | 0 |
| 0.05028810003088687 | 0.007 |
| 0.05028810003088687 | 0 |
| 0.05028810003088687 | 0 |
| 0.05028810003088687 | 0 |
| 0.05028810003088687 | 0 |
| 4.0374476786912475e-06 | 0 |
| 0.05028810003088687 | 0 |
| 0.05028810003088687 | 0 |
| 0.0 | 0 |
| 0.0074213715904612775 | 0 |
| 0.0 | 0 |
| 0.05023271666080879 | 0 |
| 0.0 | 0 |
| 12.184341417175233 | 0 |
| 0.0 | 0 |
| 0.0 | 0 |
| 0.0 | 0 |
| 0.0 | 0 |
| 0.0 | 0 |
| 0.0 | 0 |
| 0.0 | 0 |
| 0.0 | 0.261 |
| 0.0 | 0.261 |
| 0.0 | 1.76 |
| 0.0 | 0 |
| 0.0 | 1.76 |
| 0.0 | 1.76 |
| 0.0 | 0 |
| 0.0 | 0 |
| 0.0 | 0 |
| 0.0 | 0 |
| 0.0 | 0 |
| 0.0 | 0 |
| 0.0 | 0 |
| 0.0 | 0 |
| 0.0 | 0 |
| 0.0 | 0.069 |
| 0.0 | 9.397 |
| 0.0 | 9.397 |
| 0.0 | 9.397 |
| 0.0 | 0 |
| 0.0 | 9.397 |
| 0.0 | 9.397 |
| 0.002331639880286715 | 0 |
| 0.002331639880286715 | 0 |
| 0.00047352781416749195 | 0 |
| 0.00047352781416749195 | 0 |
| 0.00047352781416749195 | 0 |
| 0.023814849133569772 | 0 |
| 0.023814849133569772 | 0 |
| 0.023814849133569772 | 0 |
| 0.023814849133569772 | 0 |
| 0.023814849133569772 | 0 |
| 1.0688990425067363e-09 | 0 |
| 0.023814849133569772 | 0 |
| 0.023814849133569772 | 0 |
| 0.0 | 0 |
| 0.0 | 0 |
| 0.0 | 0 |
| 0.0 | 0 |
| 0.0 | 0 |
| 0.0 | 0 |
| 0.0 | 10.165 |
| 0.0 | 10.165 |
| 0.0 | 10.165 |
| 0.0 | 10.165 |
| 0.0 | 0 |
| 0.0 | 10.165 |
| 0.0 | 10.165 |
| 0.00022153348031227693 | 0 |
| 0.00022153348031227693 | 0 |
| 0.00021931814550915418 | 0 |
| 0.00021931814550915418 | 0 |
| 0.00021931814550915418 | 0 |
| 0.014731976440766417 | 0.302 |
| 0.014731976440766417 | 0 |
| 0.014731976440766417 | 0 |
| 0.014731976440766417 | 0 |
| 0.014731976440766417 | 0 |
| 2.270718173200839e-05 | 0 |
| 0.014731976440766417 | 0 |
| 0.014731976440766417 | 0 |
| 0.0 | 0 |
| 0.0 | 0 |
| 0.0 | 0 |
| 0.0 | 0 |
| 0.0 | 0 |
| 0.0 | 0 |
| 0.0 | 0 |
| 0.0 | 0 |
| 0.0 | 0 |
| 0.0 | 0 |
| 0.0 | 0 |
| 0.6978304629836725 | 0 |
| 0.0 | 0 |
| 0.0 | 0 |
| 0.0 | 0 |
| 0.0 | 0 |
| 0.0 | 0 |
| 0.0 | 0 |
| 0.0 | 0 |
| 0.40263710046756335 | 0 |
| 0.0 | 0 |
| 1.2848941858112064 | 0 |
| 0.0 | 0 |
| 0.0 | 0 |
| 0.0 | 0 |
| 0.017722678424982156 | 0 |
| 0.0 | 0 |
| 1.5618110362015527 | 0 |
| 0.0 | 0 |
| 1.750114494466988 | 0 |
| 0.0 | 0 |
| 0.0 | 0 |
| 0.0 | 0 |
| 0.0 | 0 |
| 0.0 | 0 |
| 0.03356232226730996 | 0 |
| 0.0 | 0 |
| 23.980999243803982 | 0 |
| 0.0 | 0 |
| 0.0 | 0 |
| 0.0 | 0 |
| 0.0 | 0 |
| 0.0 | 0 |
| 0.0 | 0 |
| 0.0 | 0 |
| 0.0 | 0 |
| 0.0 | 0 |
| 0.0 | 0 |
| 0.0 | 0 |
| 0.0 | 0 |
| 0.0 | 0 |
| 0.0 | 0 |
| 0.0 | 0 |
| 0.0 | 0 |
| 0.0 | 0 |
| 0.0 | 0 |
| 0.0 | 0 |
| 0.16448860913186564 | 0 |
| 0.0 | 0 |
| 0.0 | 0 |
| 0.0 | 0 |
| 0.0 | 0 |
| 0.0 | 0 |
| 0.0 | 0 |
| 0.0 | 0 |
| 0.0 | 0 |
| 0.0 | 0 |
| 0.0 | 0 |
| 0.0 | 0 |
| 0.0 | 0 |
| 0.0 | 0 |
| 0.0 | 0 |
| 0.0 | 0 |
| 0.0 | 0 |
| 0.0 | 0 |
| 0.0 | 0 |
| 0.0 | 0 |
| 0.0 | 0 |
| 0.1667039439349884 | 0 |
| 0.0 | 0 |
| 0.0 | 0 |
| 0.0 | 0 |
| 0.0 | 0 |
| 0.0 | 0 |
| 0.0 | 0 |
| 0.0 | 0 |
| 0.0 | 0 |
| 0.0 | 0 |
| 0.0 | 0 |
| 0.0 | 0 |
| 0.0 | 0 |
| 0.0 | 0 |
| 0.0 | 0 |
| 0.0 | 0 |
| 0.0 | 0 |
| 0.0 | 0 |
| 0.0 | 0 |
| 0.0 | 0 |
| 0.0 | 0 |
| 0.0 | 0 |
| 0.0 | 0 |
| 0.0 | 0 |
| 0.0 | 0 |
| 0.0 | 0 |
| 0.0 | 0 |
| 0.0 | 0 |
| 0.02182104781075928 | 0 |
| 0.0 | 0 |
| 0.0079198219211639 | 0 |
| 0.0 | 0 |
| 0.0 | 0 |
| 0.005261420157416577 | 0 |
| 0.005261420157416577 | 0 |
| 0.0017113461354123394 | 0 |
| 0.0017113461354123394 | 0 |
| 0.0017113461354123394 | 0 |
| 0.0653523766921217 | 7.795 |
| 0.0653523766921217 | 0 |
| 0.0653523766921217 | 25.188 |
| 0.0653523766921217 | 25.188 |
| 0.0653523766921217 | 89.226 |
| 1.0024389984130532e-06 | 0 |
| 0.0653523766921217 | 89.226 |
| 0.0653523766921217 | 89.226 |
| 0.0 | 0 |
| 0.0 | 0 |
| 0.0 | 0 |
| 0.0 | 0 |
| 0.0 | 0.501 |
| 0.0 | 0.683 |
| 0.0 | 2.11 |
| 0.0 | 0 |
| 0.0 | 2.11 |
| 0.0 | 2.11 |
| 0.0 | 0 |
| 0.0 | 0 |
| 0.0 | 0 |
| 0.0 | 0 |
| 0.0 | 0 |
| 0.008473655621944593 | 0 |
| 0.008473655621944593 | 0 |
| 0.008473655621944593 | 3.353 |
| 0.008473655621944593 | 3.353 |
| 0.008473655621944593 | 13.32 |
| 6.202937448743755e-12 | 0 |
| 0.008473655621944593 | 13.32 |
| 0.008473655621944593 | 13.32 |
| 0.0 | 0 |
| 0.2531020012567764 | 0 |
| 0.0 | 0 |
| 0.0 | 0 |
| 0.0 | 0 |
| 0.0 | 0 |
| 0.0 | 0 |
| 0.0 | 0 |
| 0.0 | 0 |
| 0.0 | 0 |
| 0.0 | 0 |
| 0.0 | 0 |
| 0.0 | 0 |
| 0.0 | 0 |
| 0.0 | 0 |
| 0.0 | 0 |
| 0.0 | 0 |
| 0.0 | 0 |
| 0.0 | 0 |
| 0.0 | 0 |
| 0.0 | 0 |
| 0.0 | 0 |
| 0.0 | 0 |
| 0.0 | 0 |
| 0.0 | 0 |
| 0.0 | 0 |
| 0.0 | 0 |
| 0.0 | 0 |
| 0.0 | 0 |
| 0.0 | 0 |
| 0.0 | 0 |
| 0.0029131652661064417 | 0 |
| 0.0 | 0 |
| 0.0 | 0 |
| 0.0 | 0 |
| 0.0 | 0 |
| 0.0 | 0 |
| 0.0 | 0 |
| 0.0 | 0 |
| 0.0 | 0 |
| 0.0 | 0 |
| 0.0 | 0 |
| 0.0 | 0 |
| 0.0 | 0 |
| 0.0 | 0 |
| 0.0 | 0 |
| 0.0 | 0 |
| 0.0 | 0 |
| 0.0 | 0 |
| 0.0 | 0 |
| 0.0 | 0 |
| 0.0 | 0 |
| 0.0 | 0 |
| 0.0 | 0 |
| 0.0 | 0 |
| 0.0 | 0 |
| 0.0 | 0 |
| 0.0 | 0 |
| 0.0 | 0 |
| 0.0 | 0 |
| 0.0 | 0 |
| 0.0 | 0 |
| 0.0 | 0 |
| 0.0 | 0 |
| 0.0 | 0 |
| 0.0 | 0 |
| 0.0 | 0 |
| 0.0 | 0 |
| 0.0 | 0 |
| 0.0 | 0 |
| 0.0 | 0 |
| 0.0 | 0 |
| 0.0 | 0 |
| 0.0 | 0 |
| 0.0 | 0 |
| 0.0 | 0 |
| 0.0 | 0 |
| 0.0 | 0 |
| 1.8498045606075125e-09 | 0 |
| 1.8498045606075125e-09 | 0 |
| 2.1433364220212795e-09 | 0 |
| 2.1433364220212795e-09 | 0 |
| 2.1433364220212795e-09 | 0 |
| 0.0 | 0 |
| 0.0 | 0 |
| 0.0 | 0 |
| 0.0 | 0 |
| 0.0 | 0 |
| 0.0 | 0 |
| 0.0 | 0 |
| 0.0 | 0 |
| 0.0 | 0 |
| 0.0 | 0 |
| 0.0 | 0 |
| 0.0 | 0 |
| 0.0 | 0 |
| 0.0 | 0 |
| 0.0 | 0 |
| 2.7359384818566205e-08 | 0 |
| 2.7359384818566205e-08 | 0 |
| 3.051623691301615e-08 | 0 |
| 3.051623691301615e-08 | 0 |
| 3.051623691301615e-08 | 0 |
| 0.0 | 0 |
| 0.0 | 0 |
| 0.0 | 0.007 |
| 0.0 | 0.007 |
| 0.0 | 19.433 |
| 0.0 | 0 |
| 0.0 | 19.433 |
| 0.0 | 19.433 |
| 5.815253858197271 | 0 |
| 5.815253858197271 | 0 |
| 5.815253858197271 | 1648.71 |
| 5.815253858197271 | 1648.71 |
| 5.815253858197271 | 8003.7 |
| 0.00021765664440681208 | 0 |
| 5.815253858197271 | 8003.7 |
| 5.815253858197271 | 8003.7 |
| 3.893450916488267e-06 | 0 |
| 3.893450916488267e-06 | 0 |
| 2.7193234708331994e-06 | 0 |
| 2.7193234708331994e-06 | 0 |
| 2.7193234708331994e-06 | 0 |
| 0.0 | 0 |
| 0.0 | 0 |
| 0.0 | 0 |
| 0.0 | 0 |
| 0.0 | 0 |
| 0.0 | 0 |
| 0.0 | 0 |
| 0.0 | 0 |
| 0.0 | 0 |
| 0.0 | 0 |
| 0.0 | 0 |
| 0.0 | 0 |
| 0.0 | 0 |
| 0.0 | 0 |
| 0.0 | 0 |
| 0.0 | 0 |
| 0.0 | 0 |
| 0.0 | 0 |
| 0.0 | 0 |
| 0.0 | 0 |
| 0.0 | 0 |
| 0.0 | 0 |
| 0.0 | 0 |
| 0.0 | 0 |
| 0.0 | 0 |
| 0.0 | 0 |
| 1.024592346444281e-05 | 0 |
| 1.024592346444281e-05 | 0 |
| 1.0467456944755086e-05 | 0 |
| 1.0467456944755086e-05 | 0 |
| 1.0467456944755086e-05 | 0 |
| 3.660840762160377 | 0 |
| 3.660840762160377 | 0 |
| 3.660840762160377 | 0 |
| 3.660840762160377 | 0 |
| 3.660840762160377 | 0 |
| 9.47055628334984e-05 | 0 |
| 3.660840762160377 | 0 |
| 3.660840762160377 | 0 |
| 0.0001251664163764365 | 0 |
| 0.0001251664163764365 | 0 |
| 0.0001251664163764365 | 0 |
| 0.0001251664163764365 | 0 |
| 0.0001251664163764365 | 0 |
| 0.0 | 0 |
| 0.0 | 0 |
| 0.0 | 0 |
| 0.0 | 0 |
| 0.0 | 0 |
| 0.0 | 0 |
| 0.0 | 0 |
| 0.0 | 0 |
| 0.0 | 0 |
| 0.0 | 0 |
| 0.0 | 0 |
| 0.0 | 0 |
| 0.0 | 0 |
| 0.0 | 0 |
| 0.0 | 0 |
| 0.0 | 0 |
| 0.0 | 0 |
| 0.0 | 0 |
| 0.0 | 0 |
| 0.0 | 0 |
| 0.0 | 0 |
| 0.0 | 0 |
| 0.0 | 0 |
| 0.0 | 0 |
| 0.0 | 0 |
| 0.0 | 0 |
| 0.0 | 0 |
| 0.0 | 0 |
| 0.0 | 0 |
| 0.0 | 0 |
| 0.0 | 0 |
| 0.0 | 0 |
| 0.0 | 0 |
| 0.0 | 0 |
| 0.0 | 0 |
| 0.0 | 0 |
| 0.0 | 0 |
| 0.0 | 0 |
| 0.0 | 0 |
| 0.0 | 0 |
| 0.0 | 0 |
| 0.0 | 0 |
| 0.0 | 0 |
| 0.0 | 0 |
| 0.0 | 0 |
| 0.0 | 0 |
| 0.0 | 0 |
| 0.0 | 0 |
| 0.0 | 0 |
| 0.0 | 0 |
| 0.0 | 0 |
| 0.0 | 0 |
| 0.0 | 0 |
| 0.0 | 0 |
| 0.0 | 0 |
| 0.0 | 0 |
| 0.0 | 0 |
| 0.0 | 0 |
| 0.0 | 0 |
| 0.0 | 0 |
| 0.0 | 0 |
| 0.0 | 0 |
| 0.0 | 0 |
| 0.0 | 0 |
| 0.0 | 0 |
| 0.0 | 0 |
| 0.0 | 0 |
| 0.0 | 0 |
| 0.0 | 0 |
| 0.0 | 0 |
| 8.636482729974116 | 0 |
| 8.636482729974116 | 0 |
| 8.636482729974116 | 0 |
| 8.636482729974116 | 0 |
| 8.636482729974116 | 0 |
| 0.0010700067099082976 | 0 |
| 8.636482729974116 | 0 |
| 8.636482729974116 | 0 |
| 0.0 | 0 |
| 0.0 | 0 |
| 0.0 | 0 |
| 0.0 | 0 |
| 0.0 | 0 |
| 0.0 | 0 |
| 0.0 | 0 |
| 0.0 | 0 |
| 0.0 | 0 |
| 0.0 | 0 |
| 0.0 | 0 |
| 0.0 | 0 |
| 0.0 | 0 |
| 0.0 | 0 |
| 0.0 | 0 |
| 0.0 | 0 |
| 0.0 | 0 |
| 0.0 | 0 |
| 0.0 | 0 |
| 0.0 | 0 |
| 0.0 | 0 |
| 0.0 | 0 |
| 0.0 | 0 |
| 0.0 | 0 |
| 0.0 | 0 |
| 0.0 | 0 |
| 0.0 | 0 |
| 0.0 | 0 |
| 0.0 | 0 |
| 0.0 | 0 |
| 0.0 | 0 |
| 0.0 | 0 |
| 0.0 | 0 |
| 0.017833445165138292 | 0 |
| 0.017833445165138292 | 0 |
| 0.017667295054904088 | 0 |
| 0.017667295054904088 | 0 |
| 0.017667295054904088 | 0 |
| 0.0 | 0 |
| 0.0 | 0 |
| 0.0 | 0 |
| 0.0 | 0 |
| 0.0 | 0 |
| 0.0 | 0 |
| 0.0 | 0 |
| 0.0 | 0 |
| 0.0 | 0 |
| 0.0 | 0 |
| 0.0 | 0 |
| 0.0 | 0 |
| 0.0 | 0 |
| 0.0 | 0 |
| 0.0 | 0 |
| 0.0 | 0 |
| 0.0 | 0 |
| 0.0 | 0 |
| 0.0 | 0 |
| 0.0 | 0 |
| 0.0 | 0 |
| 0.0 | 0 |
| 0.0 | 0 |
| 0.0 | 0 |
| 0.0 | 0 |
| 0.0 | 0 |
| 0.0 | 0 |
| 0.0 | 0 |
| 0.0 | 0 |
| 0.0 | 0 |
| 0.0 | 0 |
| 0.0 | 0 |
| 0.0 | 0 |
| 0.0 | 0 |
| 0.0 | 0 |
| 0.0 | 0 |
| 0.0 | 0 |
| 0.0 | 0 |
| 0.0 | 0 |
| 0.0 | 0 |
| 0.0 | 0 |
| 0.0 | 0 |
| 0.0 | 0 |
| 0.0 | 0 |
| 0.0 | 0 |
| 0.0 | 0 |
| 0.0 | 0 |
| 0.0 | 0 |
| 0.0 | 0 |
| 0.0 | 0 |
| 0.32399271495670506 | 0 |
| 0.0 | 0 |
| 0.020657997039119826 | 0 |
| 0.0 | 0 |
| 0.0 | 0 |
| 0.0 | 0 |
| 0.0 | 0 |
| 0.0 | 0 |
| 0.0 | 0 |
| 0.0 | 0 |
| 0.0 | 0 |
| 0.0 | 0 |
| 0.0 | 0 |
| 0.0 | 0 |
| 0.0 | 0 |
| 0.0 | 0 |
| 0.0 | 0 |
| 0.0 | 0 |
| 0.0 | 0 |
| 0.0 | 0 |
| 0.0 | 0 |
| 0.0 | 0 |
| 0.0 | 0 |
| 0.0 | 0 |
| 0.0 | 0 |
| 0.0 | 0 |
| 0.0 | 0 |
| 0.0 | 0 |
| 0.0 | 0 |
| 0.0 | 0 |
| 0.0 | 0 |
| 0.0 | 0 |
| 0.0 | 0 |
| 0.0 | 0 |
| 0.0 | 0 |
| 0.0 | 0 |
| 0.0 | 0 |
| 0.0 | 0 |
| 0.0 | 0 |
| 0.0 | 0 |
| 0.0 | 0 |
| 0.0 | 0 |
| 0.0 | 0 |
| 0.0 | 0 |
| 0.0 | 0 |
| 0.0 | 0 |
| 0.0 | 0 |
| 0.0 | 0 |
| 0.0 | 0.057 |
| 0.0 | 2.214 |
| 0.0 | 19.172 |
| 0.0 | 0 |
| 0.0 | 19.172 |
| 0.0 | 19.172 |
| 0.0 | 0 |
| 2.963010299176704 | 0 |
| 0.0 | 0 |
| 0.0 | 0 |
| 0.0 | 0 |
| 0.0 | 0 |
| 0.0 | 0 |
| 0.0 | 0 |
| 0.0 | 0 |
| 0.0 | 0 |
| 0.0 | 0 |
| 0.0 | 0 |
| 0.0 | 0 |
| 0.0 | 0 |
| 0.0 | 0 |
| 0.0 | 0 |
| 0.0 | 0 |
| 0.0 | 0 |
| 0.0 | 0 |
| 0.0 | 0 |
| 0.0 | 0 |
| 0.0 | 0 |
| 0.0 | 0 |
| 0.0 | 0 |
| 0.0 | 0 |
| 0.0 | 0 |
| 0.0 | 0 |
| 0.0 | 0 |
| 0.0 | 0 |
| 0.0 | 0 |
| 0.0 | 0 |
| 0.0 | 0 |
| 0.0 | 0 |
| 0.0 | 0 |
| 0.0 | 0 |
| 0.0 | 0 |
| 0.0 | 0 |
| 0.0 | 0 |
| 0.0 | 0 |
| 0.0 | 0 |
| 0.0 | 0 |
| 0.0 | 0 |
| 0.0 | 0 |
| 0.0 | 0 |
| 0.0 | 0 |
| 0.0 | 0 |
| 0.0 | 0 |
| 0.0165596276533427 | 0 |
| 0.0 | 0 |
| 0.6646004409368307 | 0 |
| 0.0 | 0 |
| 0.0 | 0 |
| 0.0 | 0 |
| 0.0 | 0 |
| 0.0 | 0 |
| 0.0 | 0 |
| 0.0 | 0 |
| 0.0 | 0 |
| 0.0 | 0 |
| 0.0 | 0 |
| 0.0 | 0 |
| 0.0 | 0 |
| 0.0 | 0 |
| 0.0 | 0 |
| 0.0 | 0 |
| 0.0 | 0 |
| 0.0 | 0 |
| 0.0 | 0 |
| 0.0 | 0 |
| 0.0015895027212405872 | 0 |
| 0.0015895027212405872 | 0 |
| 0.0018664195716309334 | 0 |
| 0.0018664195716309334 | 0 |
| 0.0018664195716309334 | 0 |
| 0.00042700578330191383 | 0 |
| 0.00034669989668871347 | 0 |
| 0.00037771458393243216 | 0 |
| 0.00042700578330191383 | 0 |
| 0.13624309039205032 | 0 |
| 0.13624309039205032 | 0 |
| 0.13624309039205032 | 66.45 |
| 0.13624309039205032 | 66.45 |
| 0.13624309039205032 | 112.413 |
| 4.5857430424641333e-26 | 0 |
| 0.13624309039205032 | 112.413 |
| 0.13624309039205032 | 112.413 |
| 0.0 | 0 |
| 0.0 | 0 |
| 0.0 | 0 |
| 0.0 | 0 |
| 0.0 | 0 |
| 0.0 | 0 |
| 0.0 | 0 |
| 0.0 | 0 |
| 0.0 | 0 |
| 0.0 | 0 |
| 0.0 | 0 |
| 0.0 | 0 |
| 0.0 | 0 |
| 0.0 | 0 |
| 0.0 | 0 |
| 0.0 | 0 |
| 6.701387779446378 | 0 |
| 0.0 | 0 |
| 3.660840762160377 | 0 |
| 0.0 | 0 |
| 0.0 | 0 |
| 0.0 | 0 |
| 0.0 | 0 |
| 0.0 | 0 |
| 0.0 | 0 |
| 0.0 | 0 |
| 0.0 | 0 |
| 0.0 | 0 |
| 0.0 | 0 |
| 0.0 | 0 |
| 0.0 | 0 |
| 0.0 | 0 |
| 0.0 | 0 |
| 0.0 | 0 |
| 0.0 | 0 |
| 0.0 | 0 |
| 0.0 | 0 |
| 0.0 | 0 |
| 0.0 | 0 |
| 0.0 | 0 |
| 0.0 | 0 |
| 0.0 | 0 |
| 0.0 | 0 |
| 0.0 | 0 |
| 0.0 | 0 |
| 0.0 | 0 |
| 0.0 | 0 |
| 0.0 | 0 |
| 0.42312894739644896 | 0 |
| 0.0 | 0 |
| 0.011076674015613849 | 0 |
| 0.0 | 0 |
| 0.004530359672386064 | 0 |
| 0.0 | 0 |
| 0.02043646355880755 | 0 |
| 0.015064276661234834 | 0 |
| 0.015064276661234834 | 0 |
| 0.019938013228104928 | 0 |
| 0.019938013228104928 | 0 |
| 0.019938013228104928 | 0 |
| 0.004042986015699055 | 0 |
| 0.0036663790991681836 | 0 |
| 0.004037447678691247 | 0 |
| 0.004042986015699055 | 0 |
| 1.4565826330532208 | 0 |
| 1.4565826330532208 | 0 |
| 1.4565826330532208 | 0 |
| 1.4565826330532208 | 0 |
| 1.4565826330532208 | 0 |
| 4.674356434589044e-24 | 0 |
| 1.4565826330532208 | 0 |
| 1.4565826330532208 | 0 |
| 0.0 | 0 |
| 0.0 | 0 |
| 0.0 | 0 |
| 0.0 | 0 |
| 0.0 | 0 |
| 0.0 | 0 |
| 0.0 | 0 |
| 0.0 | 0 |
| 0.0 | 0 |
| 0.0 | 0 |
| 0.0 | 0 |
| 0.0 | 0 |
| 0.0 | 0 |
| 0.0 | 0 |
| 0.0 | 0 |
| 0.0 | 0 |
| 0.0 | 0 |
| 0.0 | 0 |
| 0.0 | 0 |
| 0.0 | 0 |
| 0.0 | 0 |
| 0.0 | 0 |
| 0.0 | 0 |
| 0.011962807936862956 | 0 |
| 0.0 | 0 |
| 0.014565826330532208 | 0 |
| 0.0 | 0 |
| 0.009913623243974394 | 0 |
| 0.0 | 0 |
| 0.0009027489322725286 | 0 |
| 0.0 | 0 |
| 0.0 | 0 |
| 0.0 | 0 |
| 0.0 | 0 |
| 0.0 | 0 |
| 0.00808597203139811 | 0 |
| 1.085514053530157 | 0 |
| 1.085514053530157 | 0 |
| 0.8307505511710386 | 0 |
| 0.8307505511710386 | 0 |
| 0.8307505511710386 | 0 |
| 3.23992714956705 | 0 |
| 1.6891927873811117 | 0 |
| 0.47297398046671135 | 0 |
| 3.23992714956705 | 0 |
| 30.68238702325036 | 0 |
| 30.68238702325036 | 0 |
| 30.68238702325036 | 4679.1 |
| 30.68238702325036 | 4679.1 |
| 30.68238702325036 | 6625.8 |
| 0.017888828535216363 | 0 |
| 30.68238702325036 | 6625.8 |
| 30.68238702325036 | 6625.8 |
| 0.0 | 0 |
| 0.0 | 0 |
| 0.0 | 0 |
| 0.0 | 0 |
| 0.0 | 0 |
| 0.11519740976238402 | 0 |
| 0.0 | 0 |
| 0.0 | 0 |
| 0.0 | 0 |
| 0.0 | 0 |
| 0.0 | 0 |
| 0.03234388812559244 | 0 |
| 0.0 | 0 |
| 0.0 | 0 |
| 0.0 | 0 |
| 0.0 | 0 |
| 0.36996091212150245 | 0 |
| 0.0 | 0 |
| 0.0 | 0 |
| 0.0 | 0 |
| 0.5089731710174563 | 0 |
| 0.0 | 0 |
| 0.0 | 0 |
| 0.0 | 0 |
| 0.0 | 0 |
| 0.0 | 0 |
| 0.0 | 0 |
| 0.0 | 0 |
| 0.0008473655621944594 | 0 |
| 0.0008473655621944594 | 0 |
| 0.0008473655621944594 | 0 |
| 0.0008473655621944594 | 0 |
| 0.0008473655621944594 | 0 |
| 0.0 | 0 |
| 0.0 | 0 |
| 0.0 | 0 |
| 0.0 | 0 |
| 0.0 | 0 |
| 0.0 | 0 |
| 0.0 | 0 |
| 0.0 | 0 |
| 0.0 | 0 |
| 0.0 | 0 |
| 0.0 | 0 |
| 0.0 | 0 |
| 0.0 | 0 |
| 0.0 | 0 |
| 0.0 | 0 |
| 0.0 | 0 |
| 0.0 | 0 |
| 0.0 | 0 |
| 0.0 | 0 |
| 0.0 | 0 |
| 0.0 | 0 |
| 0.0 | 0 |
| 0.0 | 0 |
| 0.0 | 0 |
| 0.0 | 0 |
| 1.2682791747877855e-05 | 0 |
| 1.2682791747877855e-05 | 0 |
| 1.2682791747877855e-05 | 0 |
| 1.2682791747877855e-05 | 0 |
| 1.2682791747877855e-05 | 0 |
| 0.007975205291241969 | 0.029 |
| 0.007975205291241969 | 0 |
| 0.007975205291241969 | 0.248 |
| 0.007975205291241969 | 0.248 |
| 0.007975205291241969 | 4.383 |
| 3.3119255306685403e-06 | 0 |
| 0.007975205291241969 | 4.383 |
| 0.007975205291241969 | 4.383 |
| 0.0 | 0 |
| 0.0 | 0 |
| 0.0 | 0 |
| 0.0 | 0 |
| 0.0 | 0 |
| 0.0 | 0 |
| 0.0 | 0 |
| 0.0 | 0 |
| 0.0 | 0 |
| 0.0 | 0 |
| 0.0 | 0 |
| 0.0 | 0 |
| 0.0 | 0 |
| 0.0 | 0 |
| 0.0 | 0 |
| 0.0 | 0 |
| 0.0 | 0 |
| 0.0 | 0 |
| 0.0 | 0 |
| 0.0 | 0 |
| 0.0 | 0 |
| 0.0 | 0 |
| 0.0 | 0 |
| 0.0 | 0 |
| 0.0 | 0 |
| 0.0 | 0 |
| 0.0 | 0 |
| 0.0 | 0 |
| 4.9789649700184245e-06 | 0 |
| 4.9789649700184245e-06 | 0 |
| 4.973426633010618e-06 | 0 |
| 4.973426633010618e-06 | 0 |
| 4.973426633010618e-06 | 0 |
| 0.00014122759369907656 | 0 |
| 0.00014122759369907656 | 0 |
| 0.00014122759369907656 | 0 |
| 0.00014122759369907656 | 0 |
| 0.00014122759369907656 | 0 |
| 0.16005793952562009 | 0.32 |
| 0.16005793952562009 | 0 |
| 0.16005793952562009 | 0.681 |
| 0.16005793952562009 | 0.681 |
| 0.16005793952562009 | 19.911 |
| 0.00011132057385691918 | 0 |
| 0.16005793952562009 | 19.911 |
| 0.16005793952562009 | 19.911 |
| 0.0 | 0 |
| 0.0 | 0 |
| 0.0 | 0 |
| 0.0 | 0 |
| 0.0 | 0 |
| 0.0 | 0 |
| 0.0 | 0 |
| 0.0 | 0 |
| 0.0 | 0 |
| 0.0 | 0 |
| 0.0 | 0 |
| 0.0 | 0 |
| 0.0 | 0 |
| 0.0 | 0 |
| 0.0 | 0 |
| 0.0 | 0 |
| 0.0 | 0 |
| 0.0 | 0 |
| 0.0 | 0 |
| 1.6947311243889188e-05 | 0 |
| 1.6947311243889188e-05 | 0 |
| 1.3679692409283102e-05 | 0 |
| 1.3679692409283102e-05 | 0 |
| 1.3679692409283102e-05 | 0 |
| 0.0006202937448743756 | 0.067 |
| 0.0006202937448743756 | 0 |
| 0.0006202937448743756 | 0.153 |
| 0.0006202937448743756 | 0.153 |
| 0.0006202937448743756 | 0.794 |
| 1.00797733542086e-07 | 0 |
| 0.0006202937448743756 | 0.794 |
| 0.0006202937448743756 | 0.794 |
| 0.0 | 0 |
| 3.090392050356263 | 0 |
| 0.0 | 0 |
| 9.3597895431937 | 0 |
| 0.0 | 0 |
| 0.0 | 0 |
| 0.0 | 0 |
| 0.0 | 0 |
| 0.0 | 0 |
| 0.0 | 0.173 |
| 0.0 | 0 |
| 0.0 | 0 |
| 0.000345592229287152 | 0 |
| 0.000345592229287152 | 0 |
| 0.0004126061070816158 | 0 |
| 0.0004126061070816158 | 0 |
| 0.0004126061070816158 | 0 |
| 0.13624309039205032 | 0 |
| 0.13624309039205032 | 0 |
| 0.13624309039205032 | 0 |
| 0.13624309039205032 | 0 |
| 0.13624309039205032 | 0 |
| 2.1654897700525074e-05 | 0 |
| 0.13624309039205032 | 0 |
| 0.13624309039205032 | 0 |
| 0.0 | 0 |
| 0.0 | 0 |
| 0.0 | 0 |
| 0.0 | 0 |
| 0.0 | 0 |
| 0.0 | 0 |
| 0.0 | 0 |
| 0.0 | 0 |
| 0.0 | 0 |
| 0.0 | 0 |
| 0.0 | 0 |
| 0.0 | 0 |
| 0.0 | 0 |
| 0.0 | 0 |
| 0.0 | 0 |
| 0.0 | 0 |
| 0.0 | 0 |
| 0.0 | 0 |
| 0.0 | 0 |
| 0.0 | 0 |
| 0.0 | 0 |
| 0.0 | 0 |
| 0.0 | 0 |
| 0.0 | 0 |
| 0.0 | 0 |
| 0.0 | 0 |
| 0.0 | 0 |
| 0.0 | 0 |
| 0.0 | 0 |
| 0.0 | 0 |
| 0.0 | 0 |
| 0.0 | 0 |
| 0.0 | 0 |
| 0.0 | 0 |
| 0.0 | 0 |
| 0.0 | 0 |
| 0.0 | 0 |
| 0.0 | 0 |
| 0.0 | 0 |
| 0.0 | 0 |
| 0.0 | 0.645 |
| 0.0 | 0 |
| 0.0 | 0 |
| 0.0 | 0 |
| 0.0 | 0 |
| 0.0 | 0 |
| 0.0 | 0 |
| 0.0 | 0 |
| 0.0 | 0 |
| 1.2904325228190132 | 0 |
| 0.0 | 0 |
| 3.084853713348457 | 0 |
| 0.0 | 0 |
| 0.0 | 0 |
| 0.0 | 0 |
| 0.047629698267139545 | 0 |
| 0.0 | 0 |
| 41.7590610388642 | 0 |
| 0.0 | 0 |
| 0.0 | 0 |
| 0.012239724787253301 | 0 |
| 0.012239724787253301 | 0 |
| 0.0107997571652235 | 0 |
| 0.0107997571652235 | 0 |
| 0.0107997571652235 | 0 |
| 0.015562726991937455 | 0 |
| 0.008529038992022663 | 0 |
| 0.0032620804975982782 | 0 |
| 0.015562726991937455 | 0 |
| 0.5981403968431478 | 0 |
| 0.5981403968431478 | 0 |
| 0.5981403968431478 | 44.259 |
| 0.5981403968431478 | 44.259 |
| 0.5981403968431478 | 88.128 |
| 2.259641499185225e-24 | 0 |
| 0.5981403968431478 | 88.128 |
| 0.5981403968431478 | 88.128 |
| 0.0 | 0 |
| 0.0 | 0 |
| 0.0 | 0 |
| 0.0 | 0 |
| 0.0 | 0 |
| 0.0 | 0 |
| 0.0 | 0 |
| 0.0 | 0 |
| 0.0 | 0 |
| 0.0 | 0 |
| 0.0 | 0 |
| 0.0 | 0 |
| 0.0 | 0 |
| 0.0 | 0 |
| 0.0 | 0 |
| 0.0 | 0 |
| 0.0 | 0 |
| 0.0 | 0 |
| 0.0 | 0 |
| 0.0 | 0 |
| 0.0 | 0 |
| 0.0 | 0 |
| 0.0 | 0 |
| 0.0 | 0 |
| 0.0 | 0 |
| 0.0 | 0 |
| 0.0 | 0 |
| 0.0 | 0 |
| 0.0 | 0 |
| 0.0 | 0 |
| 0.0016781161133654977 | 0 |
| 0.0016781161133654977 | 0 |
| 0.0003727300806254059 | 0 |
| 0.0003727300806254059 | 0 |
| 0.0003727300806254059 | 0 |
| 0.0 | 0 |
| 0.6313704188899893 | 0 |
| 0.0 | 0 |
| 0.013679692409283102 | 0 |
| 3.2454654865748576e-06 | 0 |
| 3.2454654865748576e-06 | 0 |
| 4.973426633010618e-06 | 0 |
| 4.973426633010618e-06 | 0 |
| 4.973426633010618e-06 | 0 |
| 0.14288909480141862 | 0.005 |
| 0.14288909480141862 | 0 |
| 0.14288909480141862 | 0.859 |
| 0.14288909480141862 | 0.859 |
| 0.14288909480141862 | 88.014 |
| 1.2572025007721717e-06 | 0 |
| 0.14288909480141862 | 88.014 |
| 0.14288909480141862 | 88.014 |
| 0.0 | 0 |
| 0.797520529124197 | 0 |
| 0.0 | 0 |
| 0.00016061177322640078 | 0 |
| 0.0 | 0 |
| 0.0 | 0 |
| 0.0 | 0 |
| 0.0 | 0 |
| 0.0 | 0 |
| 0.0 | 0 |
| 0.0 | 0 |
| 0.0 | 0 |
| 0.0 | 0 |
| 0.0 | 0 |
| 0.0 | 0 |
| 0.0 | 0 |
| 0.0 | 0 |
| 0.0 | 0 |
| 0.0 | 0 |
| 0.0 | 0 |
| 0.0 | 0 |
| 0.0 | 0 |
| 0.0 | 0 |
| 0.0 | 0 |
| 0.0 | 0 |
| 0.9636706393584048 | 0 |
| 0.9636706393584048 | 0 |
| 0.5870637228275339 | 0 |
| 0.5870637228275339 | 0 |
| 0.5870637228275339 | 0 |
| 1.7556528314747948 | 0 |
| 0.2464559968474081 | 0 |
| 0.273593848185662 | 0 |
| 1.7556528314747948 | 0 |
| 0.0 | 0 |
| 0.0 | 0 |
| 32.45465486574857 | 0 |
| 32.45465486574857 | 0 |
| 32.45465486574857 | 0 |
| 32.45465486574857 | 0 |
| 32.45465486574857 | 0 |
| 1.36796924092831e-22 | 0 |
| 32.45465486574857 | 0 |
| 32.45465486574857 | 0 |
| 0.0 | 0 |
| 0.02265179836193032 | 0 |
| 0.0 | 0 |
| 0.0 | 0 |
| 0.0 | 0 |
| 0.0 | 0 |
| 0.0 | 0 |
| 0.0 | 0 |
| 0.0 | 0 |
| 0.0 | 0 |
| 0.0 | 0 |
| 0.0 | 0 |
| 0.0 | 0 |
| 0.0 | 0 |
| 0.0 | 0 |
| 0.0 | 0 |
| 0.0 | 0 |
| 0.0 | 0 |
| 0.0 | 0 |
| 0.0 | 0 |
| 0.0 | 0 |
| 0.0 | 0 |
| 0.0 | 0 |
| 0.0 | 0 |
| 0.0 | 0 |
| 0.0 | 0 |
| 0.0 | 0 |
| 0.0 | 0 |
| 0.0 | 0 |
| 0.0 | 0 |
| 0.0 | 0 |
| 0.0 | 0 |
| 0.0 | 0 |
| 0.0 | 0 |
| 0.0 | 0 |
| 0.0 | 0 |
| 0.0 | 0 |
| 0.0 | 0 |
| 0.0 | 0 |
| 0.0 | 0 |
| 0.0 | 0 |
| 0.00581525385819727 | 0 |
| 0.00581525385819727 | 0 |
| 0.005482953637728855 | 0 |
| 0.005482953637728855 | 0 |
| 0.005482953637728855 | 0 |
| 0.27968601889424966 | 3.262 |
| 0.27968601889424966 | 0 |
| 0.27968601889424966 | 3.747 |
| 0.27968601889424966 | 3.747 |
| 0.27968601889424966 | 53.826 |
| 0.0006202937448743756 | 0 |
| 0.27968601889424966 | 53.826 |
| 0.27968601889424966 | 53.826 |
| 0.0 | 0 |
| 0.0 | 0 |
| 0.0 | 0 |
| 0.0 | 0 |
| 0.0 | 0 |
| 0.0 | 0 |
| 0.0 | 0 |
| 0.0 | 0 |
| 0.0 | 0 |
| 0.0 | 0 |
| 0.0 | 0 |
| 0.0 | 0 |
| 0.0 | 0 |
| 0.0 | 0 |
| 0.0 | 0 |
| 0.0 | 0 |
| 0.0 | 0 |
| 0.0 | 0 |
| 0.0 | 0 |
| 0.0 | 0 |
| 0.0 | 0 |
| 0.0 | 0 |
| 0.0 | 0 |
| 0.0 | 0 |
| 0.0 | 0 |
| 0.0 | 0 |
| 0.0 | 0 |
| 0.0 | 0 |
| 0.0 | 0 |
| 0.0 | 0 |
| 0.0 | 0 |
| 0.0 | 0 |
| 0.0 | 0 |
| 0.0 | 0 |
| 0.0 | 0 |
| 0.0 | 0 |
| 0.0 | 0 |
| 0.0 | 0 |
| 0.0 | 0 |
| 0.0 | 0 |
| 0.0 | 0 |
| 0.27525534928800416 | 0 |
| 0.0 | 0 |
| 0.0 | 0 |
| 0.0 | 0 |
| 0.0 | 0 |
| 0.0 | 0 |
| 0.0 | 0 |
| 0.0 | 0 |
| 0.0 | 0 |
| 0.0 | 0 |
| 0.0 | 0 |
| 0.0 | 0 |
| 0.0 | 0 |
| 0.0 | 0 |
| 0.0 | 0 |
| 0.0 | 0 |
| 0.0 | 0 |
| 0.0 | 0 |
| 0.0 | 0 |
| 0.0 | 0 |
| 0.0 | 0 |
| 0.0 | 0 |
| 0.0 | 0 |
| 0.0 | 0 |
| 0.0 | 0 |
| 0.0 | 0 |
| 0.0 | 0 |
| 0.0 | 0 |
| 0.0 | 0 |
| 0.0 | 0 |
| 0.0 | 0 |
| 0.0 | 0 |
| 0.0 | 0 |
| 0.0 | 0 |
| 0.0 | 0 |
| 0.0 | 0 |
| 0.0 | 0 |
| 0.0 | 0 |
| 0.0 | 0 |
| 0.0 | 0 |
| 0.0 | 0 |
| 0.0 | 0 |
| 0.0 | 0 |
| 0.24977899905209228 | 0 |
| 0.24977899905209228 | 0 |
| 0.24977899905209228 | 3.779 |
| 0.24977899905209228 | 3.779 |
| 0.24977899905209228 | 176.094 |
| 0.00020491846928885618 | 0 |
| 0.24977899905209228 | 176.094 |
| 0.24977899905209228 | 176.094 |
| 0.0 | 0 |
| 0.0 | 0 |
| 0.0 | 0 |
| 0.0 | 0 |
| 0.0 | 0 |
| 0.0 | 0 |
| 0.0 | 0 |
| 0.0 | 0 |
| 0.0 | 0 |
| 0.0 | 0 |
| 0.0 | 0 |
| 0.0 | 0 |
| 0.0 | 0 |
| 0.0 | 0 |
| 0.0 | 0 |
| 0.0 | 0 |
| 0.0 | 0 |
| 0.0 | 0 |
| 0.0 | 0 |
| 0.0 | 0 |
| 0.0 | 0 |
| 0.0 | 0 |
| 0.0 | 0 |
| 0.07642905070773555 | 0 |
| 0.0 | 0 |
| 0.007199838110149001 | 0 |
| 0.0 | 0 |
| 0.31291604094109116 | 0 |
| 0.0 | 0 |
| 0.5926020598353409 | 0 |
| 0.0 | 0 |
| 0.09636706393584046 | 0 |
| 9.082872692803356e-06 | 0 |
| 9.082872692803356e-06 | 0 |
| 1.2018191306941025e-05 | 0 |
| 1.2018191306941025e-05 | 0 |
| 1.2018191306941025e-05 | 0 |
| 0.1523042677146904 | 0.009 |
| 0.1523042677146904 | 0 |
| 0.1523042677146904 | 0.732 |
| 0.1523042677146904 | 0.732 |
| 0.1523042677146904 | 66.231 |
| 3.0239320062625804e-06 | 0 |
| 0.1523042677146904 | 66.231 |
| 0.1523042677146904 | 66.231 |
| 0.0 | 0 |
| 0.0 | 0 |
| 0.0 | 0 |
| 0.0 | 0 |
| 0.0 | 0 |
| 0.004851583218838866 | 0 |
| 0.004851583218838866 | 0 |
| 0.006867537889680585 | 0 |
| 0.006867537889680585 | 0 |
| 0.006867537889680585 | 0 |
| 0.5477415300721048 | 0 |
| 0.5477415300721048 | 0 |
| 0.5477415300721048 | 0 |
| 0.5477415300721048 | 0 |
| 0.5477415300721048 | 0 |
| 1.750114494466988e-05 | 0 |
| 0.5477415300721048 | 0 |
| 0.5477415300721048 | 0 |
| 0.0 | 0 |
| 0.0 | 0 |
| 0.0 | 0 |
| 0.0 | 0 |
| 0.0 | 0 |
| 0.0 | 0 |
| 0.0 | 0 |
| 0.0 | 0 |
| 0.0 | 0 |
| 0.0 | 0 |
| 0.0 | 0 |
| 0.0 | 0 |
| 0.0 | 0 |
| 0.0 | 0 |
| 0.0 | 0 |
| 0.0 | 0 |
| 0.0 | 0 |
| 0.0 | 0 |
| 0.0 | 0 |
| 0.0 | 0 |
| 0.0 | 0 |
| 0.0 | 0 |
| 0.0 | 0 |
| 0.0 | 0 |
| 0.659062103929024 | 0 |
| 0.0 | 0 |
| 0.0 | 0 |
| 0.0 | 0 |
| 0.0 | 0 |
| 0.0 | 0 |
| 0.0 | 0 |
| 0.0 | 0 |
| 0.0 | 0 |
| 0.0 | 0 |
| 0.0 | 0 |
| 0.0 | 0 |
| 0.0 | 0 |
| 0.0 | 0 |
| 0.0 | 0 |
| 0.0 | 0 |
| 0.0 | 0 |
| 0.0 | 0 |
| 0.0 | 0 |
| 0.0 | 0 |
| 0.25697883716224124 | 0 |
| 2.7525534928800414e-06 | 0 |
| 2.7525534928800414e-06 | 0 |
| 2.9685486361845107e-06 | 0 |
| 2.9685486361845107e-06 | 0 |
| 2.9685486361845107e-06 | 0 |
| 0.0 | 0.002 |
| 0.0 | 0 |
| 0.0 | 0 |
| 0.0 | 0 |
| 0.0 | 0 |
| 0.0 | 0 |
| 0.0 | 0 |
| 0.0 | 0 |
| 0.0 | 0 |
| 0.0 | 0 |
| 0.0 | 0 |
| 0.0 | 0 |
| 0.00022319498141461902 | 0 |
| 0.0006812154519602517 | 0 |
| 0.0006812154519602517 | 0 |
| 0.00021322597480056657 | 0 |
| 0.00021322597480056657 | 0 |
| 0.00021322597480056657 | 0 |
| 0.018498045606075125 | 4.668 |
| 0.018498045606075125 | 0 |
| 0.018498045606075125 | 20.665 |
| 0.018498045606075125 | 20.665 |
| 0.018498045606075125 | 279.915 |
| 2.0048779968261066e-08 | 0 |
| 0.018498045606075125 | 279.915 |
| 0.018498045606075125 | 279.915 |
| 0.00029463952881532836 | 0 |
| 0.00029463952881532836 | 0 |
| 0.00022264114771383835 | 0 |
| 0.00022264114771383835 | 0 |
| 0.00022264114771383835 | 0 |
| 0.016061177322640077 | 0 |
| 0.016061177322640077 | 0 |
| 0.015728877102171662 | 0 |
| 0.015728877102171662 | 0 |
| 0.015728877102171662 | 0 |
| 0.0 | 0 |
| 0.44971296503392216 | 0 |
| 0.0 | 0 |
| 0.5217113461354123 | 0 |
| 0.0 | 0 |
| 0.0 | 0 |
| 0.0 | 0 |
| 0.0 | 0 |
| 0.0 | 0 |
| 0.0 | 0 |
| 0.0 | 0 |
| 0.0 | 0 |
| 0.0 | 0 |
| 0.0 | 0 |
| 0.0 | 0 |
| 0.0 | 0 |
| 0.0 | 0 |
| 0.0 | 0 |
| 0.0 | 0 |
| 0.0 | 0 |
| 0.0 | 0 |
| 0.0 | 0 |
| 0.05084193373166756 | 0 |
| 0.05084193373166756 | 0 |
| 0.05073116699151143 | 0 |
| 0.05073116699151143 | 0 |
| 0.05073116699151143 | 0 |
| 1.1408974236082263 | 0 |
| 0.3638687414129149 | 0 |
| 0.15618110362015525 | 0 |
| 1.1408974236082263 | 0 |
| 36.22072403105728 | 0 |
| 36.22072403105728 | 0 |
| 36.22072403105728 | 0 |
| 36.22072403105728 | 0 |
| 36.22072403105728 | 0 |
| 0.0037106857952306387 | 0 |
| 36.22072403105728 | 0 |
| 36.22072403105728 | 0 |
| 0.0 | 0 |
| 0.0 | 0 |
| 0.0 | 0 |
| 0.0 | 0 |
| 0.0 | 0 |
| 0.0 | 0 |
| 0.0 | 0 |
| 1.1907424566784885 | 0 |
| 1.1907424566784885 | 0 |
| 1.1907424566784885 | 2.73 |
| 1.1907424566784885 | 2.73 |
| 1.1907424566784885 | 1697.43 |
| 7.421371590461277e-06 | 0 |
| 1.1907424566784885 | 1697.43 |
| 1.1907424566784885 | 1697.43 |
| 3.8879125794804605 | 0 |
| 3.8879125794804605 | 0 |
| 3.8879125794804605 | 6.564 |
| 3.8879125794804605 | 6.564 |
| 3.8879125794804605 | 1895.61 |
| 2.3039481952476806e-05 | 0 |
| 3.8879125794804605 | 1895.61 |
| 3.8879125794804605 | 1895.61 |
| 0.03882374242472653 | 0 |
| 0.03882374242472653 | 0 |
| 0.03882374242472653 | 6.273 |
| 0.03882374242472653 | 6.273 |
| 0.03882374242472653 | 50.142 |
| 1.1852041196706817e-07 | 0 |
| 0.03882374242472653 | 50.142 |
| 0.03882374242472653 | 50.142 |
| 0.09858239873896323 | 0 |
| 0.09858239873896323 | 0 |
| 0.09858239873896323 | 0.012 |
| 0.09858239873896323 | 0.012 |
| 0.09858239873896323 | 96.735 |
| 2.1765664440681212e-05 | 0 |
| 0.09858239873896323 | 96.735 |
| 0.09858239873896323 | 96.735 |
| 0.0 | 0 |
| 0.08972105952647216 | 0 |
| 0.0 | 0 |
| 0.0 | 0 |
| 0.0 | 0 |
| 0.0 | 0 |
| 0.0 | 0 |
| 0.04153752755855192 | 0 |
| 0.0 | 0 |
| 0.0 | 0 |
| 0.0 | 0 |
| 0.0 | 0 |
| 0.0 | 0 |
| 0.0 | 0 |
| 0.0 | 0 |
| 0.0 | 0 |
| 0.0 | 0 |
| 0.0 | 0 |
| 0.0 | 0 |
| 0.0 | 0 |
| 0.0 | 0 |
| 0.0 | 0 |
| 0.0 | 0 |
| 0.0 | 0 |
| 0.0 | 0 |
| 0.0 | 0 |
| 0.0 | 0 |
| 0.0 | 0 |
| 0.0 | 0 |
| 0.0 | 0 |
| 0.0 | 0 |
| 0.0 | 0 |
| 0.0 | 0 |
| 0.0 | 0 |
| 0.0 | 0 |
| 0.0 | 0 |
| 0.0 | 0 |
| 0.0 | 0 |
| 0.0 | 0 |
| 0.0 | 0 |
| 0.0 | 0 |
| 0.0 | 0 |
| 0.0 | 0 |
| 0.0 | 0 |
| 0.0 | 0 |
| 0.0 | 0 |
| 0.0 | 0 |
| 0.0 | 0 |
| 0.0 | 0 |
| 0.0 | 0 |
| 0.0 | 0 |
| 0.0 | 0 |
| 0.0 | 0 |
| 0.0 | 0 |
| 0.0 | 0 |
| 0.0 | 0 |
| 0.0 | 0 |
| 0.014178142739985723 | 0 |
| 0.014178142739985723 | 0 |
| 0.014510442960454142 | 0 |
| 0.014510442960454142 | 0 |
| 0.014510442960454142 | 0 |
| 0.0 | 0 |
| 0.0 | 0 |
| 0.0 | 0 |
| 0.0 | 0 |
| 0.0 | 0 |
| 0.0 | 0 |
| 0.0 | 0 |
| 0.0 | 0 |
| 0.0 | 0 |
| 0.0 | 0 |
| 0.0 | 0 |
| 0.0 | 0 |
| 0.0 | 0 |
| 0.0 | 0 |
| 0.0 | 0 |
| 0.0 | 0 |
| 0.0 | 0 |
| 0.0 | 0 |
| 0.0 | 0 |
| 0.0 | 0 |
| 0.0 | 0 |
| 0.0 | 0 |
| 0.0 | 0 |
| 0.0 | 0 |
| 0.0 | 0 |
| 0.0 | 0 |
| 0.0 | 0 |
| 0.0 | 0 |
| 0.0 | 0 |
| 0.0 | 0 |
| 0.0 | 0 |
| 0.0 | 0 |
| 0.0 | 0 |
| 0.0 | 0 |
| 0.0 | 0 |
| 0.22042581291071556 | 0 |
| 0.0 | 0 |
| 0.008805955842413008 | 0 |
| 0.0 | 0 |
| 1.5784260472249734 | 0 |
| 0.0 | 0 |
| 0.0 | 0 |
| 0.0 | 0 |
| 0.0 | 0 |
| 0.0 | 0 |
| 0.0 | 0 |
| 0.0 | 0 |
| 0.0 | 0 |
| 0.6036787338509547 | 0 |
| 0.0 | 0 |
| 0.05759870488119201 | 0 |
| 0.0 | 0 |
| 0.005350033549541489 | 0 |
| 4.397439584198697e-05 | 0 |
| 4.397439584198697e-05 | 0 |
| 6.036787338509546e-05 | 0 |
| 6.036787338509546e-05 | 0 |
| 6.036787338509546e-05 | 0 |
| 0.0 | 0.117 |
| 0.0 | 4.595 |
| 0.0 | 4.595 |
| 0.0 | 25.694 |
| 0.0 | 0 |
| 0.0 | 25.694 |
| 0.0 | 25.694 |
| 0.0 | 0 |
| 0.0 | 0 |
| 0.0 | 0 |
| 0.0 | 0 |
| 0.0 | 0 |
| 0.0 | 0 |
| 0.08085972031398109 | 0 |
| 0.0 | 0 |
| 0.0 | 0 |
| 0.0 | 0 |
| 0.0 | 0 |
| 0.0 | 0 |
| 0.0 | 0 |
| 0.0 | 0.892 |
| 0.0 | 0.892 |
| 0.0 | 0.892 |
| 0.0 | 0 |
| 0.0 | 0.892 |
| 0.0 | 0.892 |
| 0.0 | 0 |
| 0.10301306834520878 | 0 |
| 0.0 | 0 |
| 0.093597895431937 | 0 |
| 0.0 | 0 |
| 0.0 | 0 |
| 0.0 | 0 |
| 0.0 | 0 |
| 0.0 | 0 |
| 0.0 | 0 |
| 0.0 | 0 |
| 0.0 | 0 |
| 0.0 | 0 |
| 0.0 | 0 |
| 0.0 | 0 |
| 0.0 | 0 |
| 0.0 | 0 |
| 0.0 | 0 |
| 0.6092170708587616 | 0 |
| 0.0022097964661149626 | 0 |
| 0.0022097964661149626 | 0 |
| 0.0008639805732178801 | 0 |
| 0.0008639805732178801 | 0 |
| 0.0008639805732178801 | 0 |
| 0.0 | 3.097 |
| 0.0 | 4.97 |
| 0.0 | 21.199 |
| 0.0 | 0 |
| 0.0 | 21.199 |
| 0.0 | 21.199 |
| 0.0 | 0 |
| 0.0 | 0 |
| 0.0 | 0 |
| 0.0 | 0 |
| 0.0 | 0 |
| 0.0 | 0 |
| 0.0 | 0.028 |
| 0.0 | 5.241 |
| 0.0 | 5.241 |
| 0.0 | 5.241 |
| 0.0 | 0 |
| 0.0 | 5.241 |
| 0.0 | 5.241 |
| 0.0002248564825169611 | 0 |
| 0.0002248564825169611 | 0 |
| 0.00022374881511539975 | 0 |
| 0.00022374881511539975 | 0 |
| 0.00022374881511539975 | 0 |
| 0.015618110362015526 | 0.391 |
| 0.015618110362015526 | 0 |
| 0.015618110362015526 | 1.504 |
| 0.015618110362015526 | 1.504 |
| 0.015618110362015526 | 8.702 |
| 9.193639432959495e-06 | 0 |
| 0.015618110362015526 | 8.702 |
| 0.015618110362015526 | 8.702 |
| 0.0 | 0 |
| 0.03339617215707575 | 0 |
| 0.0 | 0 |
| 0.0 | 0 |
| 0.0 | 0 |
| 0.0 | 0 |
| 0.0 | 0 |
| 0.0 | 0 |
| 0.0 | 0 |
| 0.0 | 0 |
| 0.0 | 0 |
| 0.0 | 0 |
| 0.0 | 0 |
| 0.0 | 0 |
| 0.0 | 0 |
| 0.0 | 0 |
| 0.0 | 0 |
| 0.0 | 0 |
| 0.0 | 0 |
| 0.0 | 0 |
| 0.0 | 0 |
| 0.0 | 0 |
| 0.0 | 0 |
| 0.0 | 0 |
| 0.0 | 0 |
| 0.0 | 0 |
| 0.0 | 0 |
| 0.00038712975684570395 | 0 |
| 0.0 | 0 |
| 0.044694379653001874 | 0 |
| 0.0 | 0 |
| 0.0 | 0 |
| 0.0 | 0 |
| 0.0 | 0 |
| 0.0 | 0 |
| 0.0 | 0 |
| 0.0 | 0 |
| 0.008529038992022663 | 0 |
| 0.0 | 0 |
| 0.0 | 0 |
| 0.0 | 0 |
| 0.0 | 0 |
| 0.0 | 0 |
| 0.06147554078665685 | 0 |
| 0.0 | 0 |
| 0.0 | 0 |
| 0.0 | 0 |
| 0.0 | 0 |
| 0.0 | 0 |
| 0.0 | 0 |
| 0.0 | 0 |
| 0.0 | 0 |
| 0.0 | 0 |
| 0.0 | 0 |
| 0.0 | 0 |
| 0.0 | 0 |
| 0.0 | 0 |
| 0.0 | 0 |
| 0.0 | 0 |
| 0.0 | 0 |
| 0.0 | 0 |
| 0.0 | 0 |
| 0.0 | 0 |
| 0.0 | 0 |
| 0.0 | 0 |
| 0.0 | 0 |
| 0.0 | 0 |
| 0.0 | 0 |
| 0.0 | 0 |
| 0.0 | 0 |
| 0.0 | 0 |
| 0.0 | 0 |
| 0.0 | 0 |
| 0.0 | 0 |
| 0.0 | 0 |
| 0.0 | 0 |
| 0.0 | 0 |
| 0.0 | 0 |
| 0.0 | 0 |
| 0.0 | 0 |
| 0.0 | 0 |
| 0.0 | 0 |
| 0.0 | 0 |
| 0.0 | 0 |
| 0.0 | 0 |
| 0.0 | 0 |
| 0.0 | 0 |
| 0.0 | 0 |
| 0.0 | 0 |
| 0.0 | 0 |
| 0.0 | 0 |
| 0.0 | 0 |
| 0.0 | 0 |
| 0.0 | 0 |
| 0.0 | 0 |
| 0.0 | 0 |
| 0.0 | 0 |
| 0.0 | 0 |
| 0.0 | 0 |
| 0.0 | 0 |
| 0.0 | 0 |
| 0.0 | 0 |
| 0.0 | 0 |
| 0.0 | 0 |
| 0.0 | 0 |
| 0.0 | 0 |
| 0.0 | 0 |
| 0.0 | 0 |
| 0.0 | 0 |
| 0.0 | 0 |
| 0.0 | 0 |
| 0.0 | 0 |
| 0.0 | 0 |
| 0.0 | 0 |
| 0.0 | 0 |
| 0.0 | 0 |
| 0.0 | 0 |
| 0.0 | 0 |
| 0.0 | 0 |
| 0.0 | 0 |
| 0.0 | 0 |
| 0.0 | 0 |
| 0.0 | 0 |
| 0.0 | 0 |
| 0.0 | 0 |
| 0.0 | 0 |
| 0.0 | 0 |
| 0.0 | 0 |
| 0.09138256062881424 | 0 |
| 0.0 | 0 |
| 0.0 | 0 |
| 0.0 | 0 |
| 0.0 | 0 |
| 0.0 | 0 |
| 0.0 | 0 |
| 0.0 | 0 |
| 0.0 | 0 |
| 0.0 | 0 |
| 0.0 | 0 |
| 0.0 | 0 |
| 0.0 | 0 |
| 0.0 | 0 |
| 0.0 | 0 |
| 0.0 | 0 |
| 0.0 | 0 |
| 0.0 | 0 |
| 0.0 | 0 |
| 0.0 | 0 |
| 0.0 | 0 |
| 0.0 | 0 |
| 0.0 | 0 |
| 0.0 | 0 |
| 0.0 | 0 |
| 0.0 | 0 |
| 0.0 | 0 |
| 0.0 | 0 |
| 0.0 | 0 |
| 0.0 | 0 |
| 0.0 | 0 |
| 0.0 | 0 |
| 0.0 | 0 |
| 0.0 | 0 |
| 0.0 | 0 |
| 0.0 | 0 |
| 0.0 | 0 |
| 0.0 | 0 |
| 0.0 | 0 |
| 0.0 | 0 |
| 0.0 | 0 |
| 0.0 | 0 |
| 0.0 | 0 |
| 0.0 | 0 |
| 0.0 | 0 |
| 0.0 | 0 |
| 0.0 | 0 |
| 0.0 | 0 |
| 0.0 | 0 |
| 0.0 | 0 |
| 0.0 | 0 |
| 0.0 | 0 |
| 0.0 | 0 |
| 0.0 | 0 |
| 0.0 | 0 |
| 7.809055181007762 | 0 |
| 7.809055181007762 | 0 |
| 3.5999190550745004 | 0 |
| 3.5999190550745004 | 0 |
| 3.5999190550745004 | 0 |
| 17.2796114643576 | 0 |
| 8.695189102256869 | 0 |
| 1.9661096377714582 | 0 |
| 17.2796114643576 | 0 |
| 28.134751999659173 | 0 |
| 28.134751999659173 | 0 |
| 28.134751999659173 | 1119.39 |
| 28.134751999659173 | 1119.39 |
| 28.134751999659173 | 2197.41 |
| 7.8644385510858315e-22 | 0 |
| 28.134751999659173 | 2197.41 |
| 28.134751999659173 | 2197.41 |
| 0.0 | 0 |
| 0.00653523766921217 | 0 |
| 0.0 | 0 |
| 0.0 | 0 |
| 0.0 | 0 |
| 0.0 | 0 |
| 0.0 | 0 |
| 0.0 | 0 |
| 0.0 | 0 |
| 0.0 | 0 |
| 0.0 | 0 |
| 0.0 | 0 |
| 0.0 | 0 |
| 0.0 | 0 |
| 0.0 | 0 |
| 0.0 | 0 |
| 0.0 | 0 |
| 0.0 | 0 |
| 0.0 | 0 |
| 0.0 | 0 |
| 0.0 | 0 |
| 0.0 | 0 |
| 0.0 | 0 |
| 0.0 | 0 |
| 0.0 | 0 |
| 0.0 | 0 |
| 0.0 | 0 |
| 9.193639432959493 | 0 |
| 9.193639432959493 | 0 |
| 5.161730091276053 | 0 |
| 5.161730091276053 | 0 |
| 5.161730091276053 | 0 |
| 18.331895495840918 | 0 |
| 9.3597895431937 | 0 |
| 2.3261015432789076 | 0 |
| 18.331895495840918 | 0 |
| 0.0 | 0 |
| 0.0 | 0 |
| 0.0 | 0 |
| 0.0 | 0 |
| 0.0 | 0 |
| 0.0 | 0 |
| 0.0 | 0 |
| 131.2585870850241 | 0 |
| 131.2585870850241 | 0 |
| 131.2585870850241 | 0 |
| 131.2585870850241 | 0 |
| 131.2585870850241 | 0 |
| 4.95127328497939e-22 | 0 |
| 131.2585870850241 | 0 |
| 131.2585870850241 | 0 |
| 0.0 | 0 |
| 0.0 | 0 |
| 0.0 | 0 |
| 0.0 | 0 |
| 0.0 | 0 |
| 0.0 | 0 |
| 0.0 | 0 |
| 0.0 | 0 |
| 0.0 | 0 |
| 0.0 | 0 |
| 0.0 | 0 |
| 0.0 | 0 |
| 0.0 | 0 |
| 0.0 | 0 |
| 0.7642905070773555 | 0 |
| 0.0 | 0 |
| 0.0 | 0 |
| 0.0 | 0 |
| 0.0 | 0 |
| 0.0 | 0 |
| 0.0 | 0 |
| 0.0 | 0 |
| 0.0 | 0 |
| 0.0 | 0 |
| 0.0 | 0 |
| 0.0 | 0 |
| 0.0 | 0 |
| 0.0 | 0 |
| 0.0 | 0 |
| 0.0 | 0 |
| 0.0 | 0 |
| 0.0 | 0 |
| 0.0 | 0 |
| 0.0 | 0 |
| 0.0 | 0 |
| 0.000725522148022707 | 0 |
| 0.000725522148022707 | 0 |
| 0.00018387278865918987 | 0 |
| 0.00018387278865918987 | 0 |
| 0.00018387278865918987 | 0 |
| 0.002403638261388205 | 0.16 |
| 0.002403638261388205 | 0 |
| 0.002403638261388205 | 0.178 |
| 0.002403638261388205 | 0.178 |
| 0.002403638261388205 | 0.69 |
| 1.2959708598268202e-14 | 0 |
| 0.002403638261388205 | 0.69 |
| 0.002403638261388205 | 0.69 |
| 0.0 | 0 |
| 0.0 | 0 |
| 0.0 | 0 |
| 0.0 | 0 |
| 0.0 | 0 |
| 0.0 | 0 |
| 0.0 | 0 |
| 0.0 | 0 |
| 0.0 | 0 |
| 0.0 | 0 |
| 0.0 | 0 |
| 0.0 | 0 |
| 0.0 | 0 |
| 0.0 | 0 |
| 0.0 | 0 |
| 0.0 | 0 |
| 0.0 | 0 |
| 0.0 | 0 |
| 0.0 | 0 |
| 0.0 | 0 |
| 0.0 | 0 |
| 0.0 | 0 |
| 0.0 | 0 |
| 0.0 | 0 |
| 0.0 | 0 |
| 0.0 | 0 |
| 0.0 | 0 |
| 0.0 | 0 |
| 0.0 | 0 |
| 0.0 | 0 |
| 0.0 | 0 |
| 0.0 | 0 |
| 0.0 | 0 |
| 0.0 | 0 |
| 0.0 | 0 |
| 0.0 | 0 |
| 0.0 | 0 |
| 0.0 | 0 |
| 0.0 | 0 |
| 0.0 | 0 |
| 0.0 | 0 |
| 0.0 | 0 |
| 0.0 | 0 |
| 0.0 | 0 |
| 0.0 | 0 |
| 0.0 | 0 |
| 0.0 | 0 |
| 0.0 | 0 |
| 0.0 | 0 |
| 0.0 | 0 |
| 0.0 | 0 |
| 0.0 | 0 |
| 0.002198719792099349 | 0 |
| 0.0 | 0 |
| 0.0 | 0 |
| 0.0 | 0 |
| 0.0 | 0 |
| 0.0 | 0 |
| 0.0 | 0 |
| 0.0 | 0 |
| 0.0 | 0 |
| 0.0 | 0 |
| 0.0 | 0 |
| 0.0 | 0 |
| 0.0 | 0 |
| 0.0 | 0 |
| 0.0 | 0 |
| 0.0 | 0 |
| 0.0 | 0 |
| 0.0 | 0 |
| 0.0 | 0 |
| 0.0 | 0 |
| 0.0 | 0 |
| 0.0 | 0 |
| 0.0 | 0 |
| 0.0 | 0 |
| 0.0 | 0 |
| 0.0 | 0 |
| 0.0 | 0 |
| 0.0 | 0 |
| 0.0 | 0 |
| 0.0 | 0 |
| 0.0 | 0 |
| 0.0 | 0 |
| 0.0 | 0 |
| 0.0 | 0 |
| 0.0 | 0 |
| 0.0 | 0 |
| 0.0 | 0 |
| 0.0 | 0 |
| 0.0 | 0 |
| 0.0 | 0 |
| 0.0 | 0 |
| 0.0 | 0 |
| 0.0 | 0 |
| 0.0 | 0 |
| 0.0 | 0 |
| 3.444845618855906e-06 | 0 |
| 3.444845618855906e-06 | 0 |
| 7.199838110149001e-06 | 0 |
| 7.199838110149001e-06 | 0 |
| 7.199838110149001e-06 | 0 |
| 0.11852041196706815 | 0.003 |
| 0.11852041196706815 | 0 |
| 0.11852041196706815 | 0.251 |
| 0.11852041196706815 | 0.251 |
| 0.11852041196706815 | 55.566 |
| 2.270718173200839e-06 | 0 |
| 0.11852041196706815 | 55.566 |
| 0.11852041196706815 | 55.566 |
| 0.0 | 0 |
| 0.0 | 0 |
| 0.0 | 0 |
| 0.0 | 0 |
| 0.0 | 0 |
| 0.0 | 0 |
| 0.0 | 0 |
| 0.0 | 0 |
| 0.0 | 0 |
| 0.0 | 0 |
| 0.0 | 0 |
| 0.0 | 0 |
| 0.0 | 0 |
| 0.0 | 0 |
| 0.0 | 0 |
| 0.0 | 0 |
| 0.0 | 0 |
| 0.0 | 0 |
| 0.0 | 0 |
| 0.0 | 0 |
| 0.0 | 0 |
| 0.0 | 0 |
| 0.0 | 0 |
| 0.0 | 0 |
| 0.0 | 0 |
| 0.0 | 0 |
| 0.0 | 0 |
| 0.0 | 0 |
| 0.0 | 0 |
| 0.0 | 0 |
| 0.0 | 0 |
| 0.0 | 0 |
| 0.0 | 0 |
| 0.0 | 0 |
| 0.0 | 0 |
| 0.0 | 0 |
| 0.0 | 0 |
| 0.0 | 0 |
| 0.0 | 0 |
| 0.0 | 0 |
| 0.0 | 0 |
| 0.0 | 0 |
| 0.0 | 0 |
| 0.0 | 0 |
| 0.0 | 0 |
| 0.0 | 0 |
| 0.0 | 0 |
| 0.0 | 0 |
| 0.0 | 0 |
| 0.0 | 0 |
| 0.0 | 0 |
| 0.0 | 0 |
| 0.0 | 0 |
| 0.0 | 0 |
| 0.0 | 0 |
| 0.0 | 0 |
| 0.0 | 0 |
| 0.0 | 0 |
| 0.0 | 0 |
| 0.0 | 0 |
| 0.0 | 0 |
| 0.0 | 0 |
| 0.0 | 0 |
| 0.0 | 0 |
| 0.0 | 0 |
| 0.0 | 0 |
| 0.0 | 0 |
| 0.0 | 0 |
| 0.0 | 0 |
| 0.0 | 0 |
| 0.0 | 0 |
| 0.0 | 0 |
| 0.0 | 0 |
| 0.0 | 0 |
| 0.0 | 0 |
| 0.0 | 0 |
| 0.0 | 0 |
| 0.0 | 0 |
| 0.0 | 0 |
| 0.0 | 0 |
| 0.0 | 0 |
| 0.0 | 0 |
| 4.685433108604657e-06 | 0 |
| 4.685433108604657e-06 | 0 |
| 4.940196610963776e-06 | 0 |
| 4.940196610963776e-06 | 0 |
| 4.940196610963776e-06 | 0 |
| 0.002110106399974438 | 0.008 |
| 0.002110106399974438 | 0 |
| 0.002110106399974438 | 0.166 |
| 0.002110106399974438 | 0.166 |
| 0.002110106399974438 | 1.99 |
| 2.830090210989338e-06 | 0 |
| 0.002110106399974438 | 1.99 |
| 0.002110106399974438 | 1.99 |
| 0.0 | 0 |
| 0.0 | 0 |
| 0.0 | 0 |
| 0.0 | 0 |
| 0.0 | 0.356 |
| 0.0 | 4.053 |
| 0.0 | 37.617 |
| 0.0 | 0 |
| 0.0 | 37.617 |
| 0.0 | 37.617 |
| 0.0 | 0 |
| 0.0 | 0 |
| 0.0 | 0 |
| 0.0 | 0 |
| 0.0 | 0 |
| 0.0941517291327177 | 0 |
| 0.0 | 0 |
| 0.0 | 0 |
| 0.0 | 0 |
| 0.0 | 0 |
| 0.0 | 0 |
| 0.0 | 0 |
| 0.0 | 0 |
| 0.0 | 0 |
| 0.0 | 0 |
| 0.0 | 0 |
| 0.0 | 0 |
| 0.0 | 0 |
| 0.0 | 0 |
| 0.0 | 0 |
| 0.0 | 0 |
| 0.0 | 0 |
| 0.0 | 0 |
| 0.0 | 0 |
| 0.0 | 0 |
| 0.0 | 0 |
| 0.0 | 0 |
| 0.0 | 0 |
| 0.0 | 0 |
| 0.0 | 0 |
| 0.0 | 0 |
| 0.0 | 0 |
| 0.9692089763662116 | 0 |
| 0.0 | 0 |
| 0.0 | 0 |
| 0.0 | 0 |
| 0.0 | 0 |
| 0.0 | 0 |
| 0.0 | 0 |
| 0.0 | 0 |
| 0.0 | 0 |
| 0.0 | 0 |
| 0.0 | 0 |
| 0.0 | 0 |
| 0.0 | 0 |
| 0.0 | 0 |
| 0.0 | 0 |
| 0.0 | 0 |
| 0.0 | 0 |
| 0.0 | 0 |
| 0.0 | 0 |
| 0.0 | 0 |
| 0.0 | 0 |
| 0.0 | 0 |
| 0.0 | 0 |
| 0.0 | 0 |
| 0.0 | 0 |
| 0.0 | 0 |
| 8.418272251866524 | 0 |
| 0.0 | 0 |
| 0.46743564345890437 | 0 |
| 0.0 | 0 |
| 0.0 | 0 |
| 0.0 | 0 |
| 0.0 | 0 |
| 0.0 | 0 |
| 0.0 | 0 |
| 0.0 | 0 |
| 0.0 | 0 |
| 0.0 | 0 |
| 0.0 | 0 |
| 0.0 | 0 |
| 0.797520529124197 | 0 |
| 0.797520529124197 | 0 |
| 0.545526195268982 | 0 |
| 0.545526195268982 | 0 |
| 0.545526195268982 | 0 |
| 1.3624309039205031 | 0 |
| 0.7089071369992863 | 0 |
| 0.20657997039119827 | 0 |
| 1.3624309039205031 | 0 |
| 22.04258129107156 | 0 |
| 22.04258129107156 | 0 |
| 22.04258129107156 | 5310.3 |
| 22.04258129107156 | 5310.3 |
| 22.04258129107156 | 10616.7 |
| 8.695189102256871e-23 | 0 |
| 22.04258129107156 | 10616.7 |
| 22.04258129107156 | 10616.7 |
| 0.0 | 0 |
| 0.0 | 0 |
| 0.0 | 0 |
| 0.244794495745066 | 0 |
| 0.0 | 0 |
| 0.0 | 0 |
| 0.0 | 0 |
| 0.25144050015443437 | 0 |
| 0.0 | 0 |
| 0.0 | 0 |
| 0.0 | 0 |
| 0.0 | 0 |
| 0.0 | 0 |
| 0.0 | 0 |
| 0.0 | 0 |
| 0.0 | 0 |
| 0.0 | 0 |
| 0.030294703432703875 | 0 |
| 0.0 | 0 |
| 4.674356434589043 | 0 |
| 0.0 | 0 |
| 0.0 | 0 |
| 0.0 | 0 |
| 0.0 | 0 |
| 0.0 | 0 |
| 0.0 | 0 |
| 0.0 | 0 |
| 0.0 | 0 |
| 0.0 | 0 |
| 0.0 | 0 |
| 0.0 | 0 |
| 0.0 | 0 |
| 0.0 | 0 |
| 0.0 | 0 |
| 0.0 | 0 |
| 0.0 | 0 |
| 0.0 | 0 |
| 0.0 | 0 |
| 0.0 | 0 |
| 0.0 | 0 |
| 0.0 | 0 |
| 0.0 | 0 |
| 0.0 | 0 |
| 0.0 | 0 |
| 0.0 | 0 |
| 0.0 | 0 |
| 0.0 | 0 |
| 0.0 | 0 |
| 0.0 | 0 |
| 0.0 | 0 |
| 0.0 | 0 |
| 0.0 | 0 |
| 0.0 | 0 |
| 0.0 | 0 |
| 0.0 | 0 |
| 0.0 | 0 |
| 0.0 | 0 |
| 0.0 | 0 |
| 0.0 | 0 |
| 0.0 | 0 |
| 0.0 | 0 |
| 0.0 | 0 |
| 0.0 | 0 |
| 0.0 | 0 |
| 0.0 | 0 |
| 0.0 | 0 |
| 0.0 | 0 |
| 0.0 | 0 |
| 0.0 | 0 |
| 0.0 | 0 |
| 0.0 | 0 |
| 0.0 | 0 |
| 0.0 | 0 |
| 0.0 | 0 |
| 0.0 | 0 |
| 0.0 | 0 |
| 0.0 | 0 |
| 0.0037660691653087085 | 0 |
| 0.0037660691653087085 | 0 |
| 0.004463899628292381 | 0 |
| 0.004463899628292381 | 0 |
| 0.004463899628292381 | 0 |
| 0.002193181455091542 | 0 |
| 0.001445505959037607 | 0 |
| 0.0009858239873896323 | 0 |
| 0.002193181455091542 | 0 |
| 0.0 | 0 |
| 0.30848537133484566 | 0 |
| 0.30848537133484566 | 0 |
| 0.30848537133484566 | 0 |
| 0.30848537133484566 | 0 |
| 0.30848537133484566 | 0 |
| 2.0713380409197894e-25 | 0 |
| 0.30848537133484566 | 0 |
| 0.30848537133484566 | 0 |
| 0.0 | 0 |
| 0.0 | 0 |
| 0.0 | 0 |
| 0.0 | 0 |
| 0.0 | 0 |
| 0.0 | 0 |
| 0.0 | 0 |
| 0.0 | 0 |
| 0.0 | 0 |
| 0.0 | 0 |
| 0.0 | 0 |
| 0.0 | 0 |
| 0.0 | 0 |
| 0.0 | 0 |
| 0.0 | 0 |
| 0.0 | 0 |
| 0.0 | 0 |
| 0.0 | 0 |
| 0.0 | 0 |
| 0.0 | 0 |
| 0.0 | 0 |
| 0.0 | 0 |
| 0.0 | 0 |
| 0.0 | 0 |
| 0.0 | 0 |
| 0.0 | 0 |
| 0.0 | 0 |
| 3.876835905464847e-06 | 0 |
| 3.876835905464847e-06 | 0 |
| 4.402977921206505e-06 | 0 |
| 4.402977921206505e-06 | 0 |
| 4.402977921206505e-06 | 0 |
| 0.03649764088144763 | 0.004 |
| 0.03649764088144763 | 0 |
| 0.03649764088144763 | 0.209 |
| 0.03649764088144763 | 0.209 |
| 0.03649764088144763 | 16.777 |
| 4.6965097826202713e-07 | 0 |
| 0.03649764088144763 | 16.777 |
| 0.03649764088144763 | 16.777 |
| 4.801738185768603e-05 | 0 |
| 4.801738185768603e-05 | 0 |
| 4.9845033070262316e-05 | 0 |
| 4.9845033070262316e-05 | 0 |
| 4.9845033070262316e-05 | 0 |
| 0.08750572472334939 | 0 |
| 0.08750572472334939 | 0 |
| 0.08750572472334939 | 0.852 |
| 0.08750572472334939 | 0.852 |
| 0.08750572472334939 | 56.658 |
| 8.418272251866525e-06 | 0 |
| 0.08750572472334939 | 56.658 |
| 0.08750572472334939 | 56.658 |
| 0.0 | 0 |
| 0.0 | 0 |
| 0.0 | 0 |
| 0.029463952881532834 | 0 |
| 0.0 | 0 |
| 0.0 | 0 |
| 0.0 | 0 |
| 0.0 | 0 |
| 0.0 | 0 |
| 0.0 | 0 |
| 0.0 | 0 |
| 0.0 | 0 |
| 0.0 | 0 |
| 0.0 | 0 |
| 0.0 | 0 |
| 0.0 | 0 |
| 0.0 | 0 |
| 0.0 | 0 |
| 0.0 | 0 |
| 0.0 | 0 |
| 0.0 | 0 |
| 0.0 | 0 |
| 0.0 | 0 |
| 0.0 | 0 |
| 0.0 | 0 |
| 0.0 | 0 |
| 0.0 | 0 |
| 0.0 | 0 |
| 0.0 | 0 |
| 0.0 | 0 |
| 0.0 | 0 |
| 0.0 | 0 |
| 0.0 | 0 |
| 0.0 | 0 |
| 0.0 | 0 |
| 0.0 | 0 |
| 0.0 | 0 |
| 0.0 | 0 |
| 0.0 | 0 |
| 0.0 | 0 |
| 0.0 | 0 |
| 0.0 | 0 |
| 0.0 | 0 |
| 0.0 | 0 |
| 0.0 | 0 |
| 0.0 | 0 |
| 0.0 | 0 |
| 0.0 | 0 |
| 0.0 | 0 |
| 0.0 | 0 |
| 0.0 | 0 |
| 0.0 | 0 |
| 0.0 | 0 |
| 0.0 | 0 |
| 0.0 | 0 |
| 0.0 | 0 |
| 0.0 | 0 |
| 0.0 | 0 |
| 0.0 | 0 |
| 0.0 | 0 |
| 0.0 | 0 |
| 0.0 | 0 |
| 0.0 | 0 |
| 0.0 | 0 |
| 0.0 | 0 |
| 0.0 | 0 |
| 0.0 | 0 |
| 0.0 | 0 |
| 0.0 | 0 |
| 0.0 | 0 |
| 0.0 | 0 |
| 0.0 | 0 |
| 0.0 | 0 |
| 0.0 | 0 |
| 0.0 | 0 |
| 0.0 | 0 |
| 0.0 | 0 |
| 0.0 | 0 |
| 0.0 | 0 |
| 0.0 | 0 |
| 0.0 | 0 |
| 0.0 | 0 |
| 0.0 | 0 |
| 0.0 | 0 |
| 0.0 | 0 |
| 0.0 | 0 |
| 0.0 | 0 |
| 0.0 | 0 |
| 0.0 | 0 |
| 0.0 | 0 |
| 0.0 | 0 |
| 0.0 | 0 |
| 0.0 | 0 |
| 0.0 | 0 |
| 0.0 | 0 |
| 0.07532138330617416 | 0 |
| 0.0 | 0 |
| 0.16227327432874286 | 0 |
| 0.0 | 0 |
| 0.35943807180666937 | 0 |
| 0.0 | 0 |
| 0.0 | 0 |
| 0.0 | 0 |
| 0.0 | 0 |
| 0.0 | 0 |
| 0.0 | 0 |
| 2769.168503903462 | 0 |
| 2769.168503903462 | 0 |
| 2769.168503903462 | 0 |
| 2769.168503903462 | 0 |
| 2769.168503903462 | 0 |
| 0.10744373795145432 | 0 |
| 2769.168503903462 | 0 |
| 2769.168503903462 | 0 |
| 0.0 | 0 |
| 0.2104568062966631 | 0 |
| 0.0 | 0 |
| 0.0 | 0 |
| 0.0 | 0 |
| 0.0 | 0 |
| 0.0 | 0 |
| 0.0 | 0 |
| 0.14898126551000623 | 0 |
| 0.0 | 0 |
| 0.0 | 0 |
| 9.193639432959493e-05 | 0 |
| 9.193639432959493e-05 | 0 |
| 9.193639432959493e-05 | 0.028 |
| 9.193639432959493e-05 | 0.028 |
| 9.193639432959493e-05 | 0.116 |
| 6.646004409368308e-13 | 0 |
| 9.193639432959493e-05 | 0.116 |
| 9.193639432959493e-05 | 0.116 |
| 0.0 | 0 |
| 0.0 | 0 |
| 0.0 | 0 |
| 0.0201595467084172 | 0 |
| 0.0 | 0 |
| 0.0 | 0 |
| 0.0 | 0 |
| 0.0 | 0 |
| 0.0 | 0 |
| 0.0 | 0 |
| 0.0 | 0.007 |
| 0.0 | 0.796 |
| 0.0 | 5.959 |
| 0.0 | 0 |
| 0.0 | 5.959 |
| 0.0 | 5.959 |
| 0.0 | 0 |
| 0.0 | 0 |
| 0.0 | 0 |
| 0.0 | 0 |
| 0.0 | 0 |
| 0.0 | 0 |
| 0.0 | 0 |
| 0.0 | 0 |
| 0.0 | 0 |
| 0.0 | 0 |
| 0.0 | 0 |
| 0.0 | 0 |
| 0.0 | 0 |
| 0.0 | 0 |
| 0.0 | 0 |
| 0.0 | 0 |
| 0.0 | 0 |
| 0.0 | 0 |
| 0.0 | 0 |
| 0.0 | 0 |
| 0.0 | 0 |
| 0.0 | 0 |
| 0.0 | 0 |
| 0.0 | 0 |
| 0.0 | 0 |
| 0.0 | 0 |
| 0.0 | 0 |
| 0.0 | 0 |
| 0.0 | 0 |
| 0.0 | 0 |
| 0.0 | 0 |
| 0.0 | 0 |
| 0.0 | 0 |
| 0.0 | 0 |
| 0.0 | 0 |
| 0.0 | 0 |
| 0.0 | 0 |
| 0.0 | 0 |
| 0.0 | 0 |
| 0.0 | 0 |
| 0.0 | 0 |
| 0.0 | 0 |
| 0.0 | 0 |
| 0.0 | 0 |
| 0.0 | 0 |
| 0.0 | 0 |
| 0.0 | 0 |
| 0.0 | 0 |
| 0.0 | 0 |
| 0.0 | 0 |
| 0.0 | 0 |
| 0.0 | 0 |
| 0.0 | 0 |
| 0.0 | 0 |
| 0.0 | 0 |
| 0.0 | 0 |
| 0.0 | 0 |
| 0.0 | 0 |
| 0.0 | 0 |
| 0.0 | 0 |
| 0.0 | 0 |
| 0.0 | 0 |
| 0.0 | 0 |
| 0.0 | 0 |
| 0.0 | 0 |
| 0.0 | 0 |
| 0.0 | 0 |
| 0.0 | 0 |
| 0.0 | 0 |
| 0.0 | 0 |
| 0.0 | 0 |
| 0.0 | 0 |
| 0.0 | 0 |
| 0.0 | 0 |
| 0.0 | 0 |
| 0.0 | 0 |
| 0.0 | 0 |
| 0.0 | 0 |
| 0.0 | 0 |
| 0.0 | 0.915 |
| 0.0 | 3.073 |
| 0.0 | 0 |
| 0.0 | 3.073 |
| 0.0 | 3.073 |
| 1.1796657826628747 | 0 |
| 1.1796657826628747 | 0 |
| 0.797520529124197 | 0 |
| 0.797520529124197 | 0 |
| 0.797520529124197 | 0 |
| 2.038108018872948 | 0 |
| 1.0578223684911223 | 0 |
| 0.3029470343270387 | 0 |
| 2.038108018872948 | 0 |
| 31.513137574421396 | 0 |
| 31.513137574421396 | 0 |
| 31.513137574421396 | 0 |
| 31.513137574421396 | 0 |
| 31.513137574421396 | 0 |
| 1.949494626748037e-22 | 0 |
| 31.513137574421396 | 0 |
| 31.513137574421396 | 0 |
| 0.0 | 0 |
| 0.0 | 0 |
| 0.08252122141632315 | 0 |
| 0.0 | 0 |
| 0.0 | 0 |
| 0.0 | 0 |
| 0.0 | 0 |
| 0.0 | 0 |
| 0.0 | 0 |
| 0.0 | 0 |
| 0.0 | 0 |
| 0.0 | 0 |
| 0.0 | 0 |
| 0.0 | 0 |
| 0.0 | 0 |
| 0.0 | 0 |
| 0.0 | 0 |
| 0.0 | 0 |
| 0.0 | 0 |
| 0.0 | 0 |
| 0.0 | 0 |
| 0.0 | 0 |
| 0.0 | 0 |
| 0.0 | 0 |
| 0.0 | 0 |
| 0.0 | 0 |
| 0.0 | 0 |
| 0.0 | 0 |
| 0.0 | 0 |
| 0.0 | 0 |
| 0.0 | 0 |
| 0.0 | 0 |
| 0.0 | 0 |
| 0.0 | 0 |
| 0.0 | 0 |
| 0.0 | 0 |
| 0.0 | 0 |
| 0.0 | 0 |
| 0.0 | 0 |
| 0.0 | 0 |
| 0.0 | 0 |
| 0.0 | 0 |
| 0.0 | 0 |
| 0.0 | 0 |
| 0.0 | 0 |
| 0.0 | 0 |
| 0.0 | 0 |
| 0.0 | 0 |
| 0.0 | 0 |
| 0.0 | 0 |
| 0.0 | 0 |
| 0.0 | 0 |
| 0.0 | 0 |
| 0.0 | 0 |
| 0.0 | 0 |
| 0.0 | 0 |
| 0.0 | 0 |
| 0.0 | 0 |
| 0.0 | 0 |
| 0.0 | 0 |
| 0.0 | 0 |
| 0.0 | 0 |
| 0.0 | 0 |
| 0.0 | 0 |
| 0.0 | 0 |
| 0.0 | 0 |
| 0.0 | 0 |
| 0.0 | 0 |
| 2.86332023303618e-06 | 0 |
| 2.86332023303618e-06 | 0 |
| 3.7273008062540595e-06 | 0 |
| 3.7273008062540595e-06 | 0 |
| 3.7273008062540595e-06 | 0 |
| 0.045137446613626425 | 0.003 |
| 0.045137446613626425 | 0 |
| 0.045137446613626425 | 0.257 |
| 0.045137446613626425 | 0.257 |
| 0.045137446613626425 | 23.23 |
| 9.41517291327177e-07 | 0 |
| 0.045137446613626425 | 23.23 |
| 0.045137446613626425 | 23.23 |
| 0.0 | 0 |
| 0.0 | 0 |
| 0.0 | 0 |
| 0.0 | 0 |
| 0.0 | 0 |
| 0.0 | 0 |
| 0.0 | 0 |
| 0.0 | 0 |
| 0.0731060485030514 | 0 |
| 0.0731060485030514 | 0 |
| 0.04148214418847386 | 0 |
| 0.04148214418847386 | 0 |
| 0.04148214418847386 | 0 |
| 0.08916722582569148 | 0 |
| 0.016282710802952356 | 0 |
| 0.0158396438423278 | 0 |
| 0.08916722582569148 | 0 |
| 0.0 | 0 |
| 2.4811749794975015 | 0 |
| 2.4811749794975015 | 0 |
| 2.4811749794975015 | 0 |
| 2.4811749794975015 | 0 |
| 2.4811749794975015 | 0 |
| 5.1340384062370185e-24 | 0 |
| 2.4811749794975015 | 0 |
| 2.4811749794975015 | 0 |
| 0.0 | 0 |
| 0.0 | 0 |
| 0.0 | 0 |
| 0.0 | 0 |
| 0.0 | 0 |
| 0.0 | 0 |
| 0.0 | 0 |
| 0.0 | 0 |
| 0.0 | 0 |
| 0.0 | 0 |
| 0.0 | 0 |
| 0.0 | 0 |
| 0.0 | 0 |
| 0.0 | 0 |
| 0.0 | 0 |
| 0.0 | 0 |
| 0.0 | 0 |
| 0.0 | 0 |
| 0.0 | 0 |
| 0.0 | 0 |
| 0.0 | 0 |
| 0.0 | 0 |
| 0.0 | 0 |
| 0.0 | 0 |
| 0.0 | 0 |
| 0.0 | 0 |
| 0.0 | 0 |
| 0.0 | 0 |
| 0.0 | 0 |
| 0.0 | 0 |
| 0.0 | 0 |
| 0.0 | 0 |
| 0.0 | 0 |